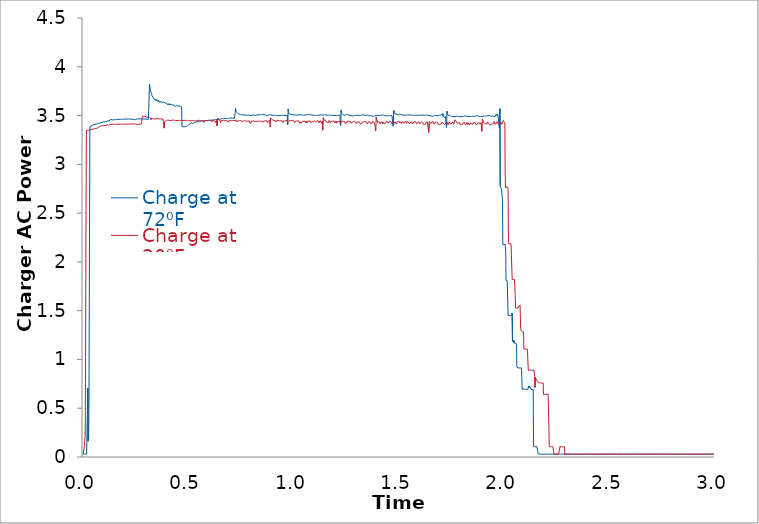
| Category | Charge at 72⁰F | Charge at 20⁰F |
|---|---|---|
| 0.0 | 0.029 | 0.029 |
| 0.00138888888888889 | 0.029 | 0.029 |
| 0.00277777777777778 | 0.03 | 0.029 |
| 0.00416666666666667 | 0.03 | 0.03 |
| 0.00555555555555556 | 0.03 | 0.107 |
| 0.00694444444444444 | 0.03 | 0.159 |
| 0.00833333333333333 | 0.03 | 0.152 |
| 0.00972222222222222 | 0.03 | 0.212 |
| 0.0111111111111111 | 0.03 | 0.763 |
| 0.0125 | 0.03 | 1.694 |
| 0.0138888888888889 | 0.03 | 2.648 |
| 0.0152777777777778 | 0.03 | 3.348 |
| 0.0166666666666667 | 0.03 | 3.348 |
| 0.0180555555555556 | 0.03 | 3.344 |
| 0.0194444444444444 | 0.03 | 3.345 |
| 0.0208333333333333 | 0.03 | 3.349 |
| 0.0222222222222222 | 0.708 | 3.345 |
| 0.0236111111111111 | 0.163 | 3.349 |
| 0.025 | 0.155 | 3.35 |
| 0.0263888888888889 | 0.211 | 3.35 |
| 0.0277777777777778 | 0.617 | 3.352 |
| 0.0291666666666667 | 1.54 | 3.352 |
| 0.0305555555555556 | 2.491 | 3.351 |
| 0.0319444444444444 | 3.382 | 3.352 |
| 0.0333333333333333 | 3.384 | 3.353 |
| 0.0347222222222222 | 3.384 | 3.355 |
| 0.0361111111111111 | 3.386 | 3.358 |
| 0.0375 | 3.385 | 3.36 |
| 0.0388888888888889 | 3.393 | 3.358 |
| 0.0402777777777778 | 3.4 | 3.357 |
| 0.0416666666666667 | 3.403 | 3.358 |
| 0.0430555555555556 | 3.401 | 3.36 |
| 0.0444444444444444 | 3.399 | 3.36 |
| 0.0458333333333333 | 3.402 | 3.361 |
| 0.0472222222222222 | 3.404 | 3.363 |
| 0.0486111111111111 | 3.404 | 3.363 |
| 0.05 | 3.407 | 3.365 |
| 0.0513888888888889 | 3.407 | 3.366 |
| 0.0527777777777778 | 3.411 | 3.364 |
| 0.0541666666666667 | 3.407 | 3.366 |
| 0.0555555555555556 | 3.412 | 3.368 |
| 0.0569444444444444 | 3.411 | 3.367 |
| 0.0583333333333333 | 3.411 | 3.369 |
| 0.0597222222222222 | 3.409 | 3.368 |
| 0.0611111111111111 | 3.411 | 3.373 |
| 0.0625 | 3.413 | 3.367 |
| 0.0638888888888889 | 3.417 | 3.368 |
| 0.0652777777777778 | 3.417 | 3.37 |
| 0.0666666666666667 | 3.413 | 3.371 |
| 0.0680555555555556 | 3.416 | 3.372 |
| 0.0694444444444445 | 3.418 | 3.374 |
| 0.0708333333333333 | 3.421 | 3.376 |
| 0.0722222222222222 | 3.418 | 3.377 |
| 0.0736111111111111 | 3.419 | 3.376 |
| 0.075 | 3.422 | 3.387 |
| 0.0763888888888889 | 3.423 | 3.387 |
| 0.0777777777777778 | 3.424 | 3.387 |
| 0.0791666666666667 | 3.424 | 3.387 |
| 0.0805555555555556 | 3.427 | 3.391 |
| 0.0819444444444444 | 3.426 | 3.391 |
| 0.0833333333333333 | 3.425 | 3.388 |
| 0.0847222222222222 | 3.425 | 3.39 |
| 0.0861111111111111 | 3.427 | 3.392 |
| 0.0875 | 3.429 | 3.394 |
| 0.0888888888888889 | 3.429 | 3.395 |
| 0.0902777777777778 | 3.431 | 3.396 |
| 0.0916666666666667 | 3.431 | 3.394 |
| 0.0930555555555556 | 3.433 | 3.397 |
| 0.0944444444444444 | 3.436 | 3.395 |
| 0.0958333333333333 | 3.433 | 3.399 |
| 0.0972222222222222 | 3.43 | 3.398 |
| 0.0986111111111111 | 3.431 | 3.395 |
| 0.1 | 3.432 | 3.398 |
| 0.101388888888889 | 3.435 | 3.4 |
| 0.102777777777778 | 3.438 | 3.394 |
| 0.104166666666667 | 3.438 | 3.396 |
| 0.105555555555556 | 3.439 | 3.398 |
| 0.106944444444444 | 3.44 | 3.398 |
| 0.108333333333333 | 3.441 | 3.4 |
| 0.109722222222222 | 3.441 | 3.399 |
| 0.111111111111111 | 3.439 | 3.401 |
| 0.1125 | 3.441 | 3.403 |
| 0.113888888888889 | 3.444 | 3.404 |
| 0.115277777777778 | 3.444 | 3.404 |
| 0.116666666666667 | 3.442 | 3.401 |
| 0.118055555555556 | 3.446 | 3.41 |
| 0.119444444444444 | 3.441 | 3.407 |
| 0.120833333333333 | 3.445 | 3.402 |
| 0.122222222222222 | 3.446 | 3.403 |
| 0.123611111111111 | 3.442 | 3.406 |
| 0.125 | 3.444 | 3.405 |
| 0.126388888888889 | 3.455 | 3.406 |
| 0.127777777777778 | 3.457 | 3.406 |
| 0.129166666666667 | 3.456 | 3.405 |
| 0.130555555555556 | 3.457 | 3.407 |
| 0.131944444444444 | 3.461 | 3.408 |
| 0.133333333333333 | 3.456 | 3.41 |
| 0.134722222222222 | 3.46 | 3.411 |
| 0.136111111111111 | 3.46 | 3.41 |
| 0.1375 | 3.454 | 3.412 |
| 0.138888888888889 | 3.457 | 3.41 |
| 0.140277777777778 | 3.458 | 3.408 |
| 0.141666666666667 | 3.456 | 3.41 |
| 0.143055555555556 | 3.456 | 3.409 |
| 0.144444444444444 | 3.457 | 3.413 |
| 0.145833333333333 | 3.458 | 3.416 |
| 0.147222222222222 | 3.456 | 3.41 |
| 0.148611111111111 | 3.459 | 3.41 |
| 0.15 | 3.459 | 3.414 |
| 0.151388888888889 | 3.457 | 3.41 |
| 0.152777777777778 | 3.458 | 3.414 |
| 0.154166666666667 | 3.457 | 3.409 |
| 0.155555555555556 | 3.46 | 3.408 |
| 0.156944444444444 | 3.461 | 3.408 |
| 0.158333333333333 | 3.463 | 3.41 |
| 0.159722222222222 | 3.462 | 3.41 |
| 0.161111111111111 | 3.458 | 3.407 |
| 0.1625 | 3.46 | 3.409 |
| 0.163888888888889 | 3.459 | 3.408 |
| 0.165277777777778 | 3.461 | 3.41 |
| 0.166666666666667 | 3.461 | 3.41 |
| 0.168055555555556 | 3.463 | 3.411 |
| 0.169444444444444 | 3.462 | 3.408 |
| 0.170833333333333 | 3.461 | 3.411 |
| 0.172222222222222 | 3.459 | 3.409 |
| 0.173611111111111 | 3.457 | 3.407 |
| 0.175 | 3.459 | 3.409 |
| 0.176388888888889 | 3.462 | 3.412 |
| 0.177777777777778 | 3.46 | 3.41 |
| 0.179166666666667 | 3.458 | 3.411 |
| 0.180555555555556 | 3.458 | 3.411 |
| 0.181944444444444 | 3.462 | 3.41 |
| 0.183333333333333 | 3.461 | 3.412 |
| 0.184722222222222 | 3.46 | 3.412 |
| 0.186111111111111 | 3.463 | 3.412 |
| 0.1875 | 3.462 | 3.411 |
| 0.188888888888889 | 3.461 | 3.413 |
| 0.190277777777778 | 3.464 | 3.415 |
| 0.191666666666667 | 3.462 | 3.416 |
| 0.193055555555556 | 3.462 | 3.413 |
| 0.194444444444444 | 3.465 | 3.411 |
| 0.195833333333333 | 3.465 | 3.408 |
| 0.197222222222222 | 3.464 | 3.412 |
| 0.198611111111111 | 3.466 | 3.411 |
| 0.2 | 3.466 | 3.409 |
| 0.201388888888889 | 3.467 | 3.411 |
| 0.202777777777778 | 3.464 | 3.413 |
| 0.204166666666667 | 3.464 | 3.413 |
| 0.205555555555556 | 3.464 | 3.413 |
| 0.206944444444444 | 3.464 | 3.411 |
| 0.208333333333333 | 3.46 | 3.414 |
| 0.209722222222222 | 3.462 | 3.411 |
| 0.211111111111111 | 3.463 | 3.414 |
| 0.2125 | 3.462 | 3.412 |
| 0.213888888888889 | 3.464 | 3.412 |
| 0.215277777777778 | 3.465 | 3.412 |
| 0.216666666666667 | 3.466 | 3.413 |
| 0.218055555555556 | 3.466 | 3.411 |
| 0.219444444444444 | 3.465 | 3.414 |
| 0.220833333333333 | 3.465 | 3.412 |
| 0.222222222222222 | 3.461 | 3.414 |
| 0.223611111111111 | 3.462 | 3.415 |
| 0.225 | 3.462 | 3.412 |
| 0.226388888888889 | 3.463 | 3.413 |
| 0.227777777777778 | 3.461 | 3.415 |
| 0.229166666666667 | 3.464 | 3.416 |
| 0.230555555555556 | 3.461 | 3.417 |
| 0.231944444444444 | 3.462 | 3.415 |
| 0.233333333333333 | 3.463 | 3.416 |
| 0.234722222222222 | 3.462 | 3.417 |
| 0.236111111111111 | 3.46 | 3.414 |
| 0.2375 | 3.462 | 3.415 |
| 0.238888888888889 | 3.46 | 3.414 |
| 0.240277777777778 | 3.457 | 3.411 |
| 0.241666666666667 | 3.46 | 3.413 |
| 0.243055555555556 | 3.459 | 3.413 |
| 0.244444444444444 | 3.458 | 3.415 |
| 0.245833333333333 | 3.464 | 3.412 |
| 0.247222222222222 | 3.461 | 3.413 |
| 0.248611111111111 | 3.458 | 3.413 |
| 0.25 | 3.459 | 3.413 |
| 0.251388888888889 | 3.462 | 3.414 |
| 0.252777777777778 | 3.464 | 3.416 |
| 0.254166666666667 | 3.464 | 3.409 |
| 0.255555555555556 | 3.463 | 3.412 |
| 0.256944444444444 | 3.464 | 3.41 |
| 0.258333333333333 | 3.465 | 3.412 |
| 0.259722222222222 | 3.465 | 3.408 |
| 0.261111111111111 | 3.466 | 3.412 |
| 0.2625 | 3.463 | 3.413 |
| 0.263888888888889 | 3.466 | 3.411 |
| 0.265277777777778 | 3.467 | 3.411 |
| 0.266666666666667 | 3.466 | 3.413 |
| 0.268055555555556 | 3.469 | 3.411 |
| 0.269444444444444 | 3.469 | 3.41 |
| 0.270833333333333 | 3.467 | 3.411 |
| 0.272222222222222 | 3.468 | 3.411 |
| 0.273611111111111 | 3.463 | 3.41 |
| 0.275 | 3.464 | 3.413 |
| 0.276388888888889 | 3.463 | 3.413 |
| 0.277777777777778 | 3.463 | 3.414 |
| 0.279166666666667 | 3.465 | 3.411 |
| 0.280555555555556 | 3.465 | 3.48 |
| 0.281944444444444 | 3.464 | 3.494 |
| 0.283333333333333 | 3.465 | 3.497 |
| 0.284722222222222 | 3.467 | 3.491 |
| 0.286111111111111 | 3.463 | 3.488 |
| 0.2875 | 3.465 | 3.486 |
| 0.288888888888889 | 3.464 | 3.49 |
| 0.290277777777778 | 3.463 | 3.491 |
| 0.291666666666667 | 3.463 | 3.49 |
| 0.293055555555556 | 3.463 | 3.497 |
| 0.294444444444444 | 3.464 | 3.487 |
| 0.295833333333333 | 3.463 | 3.491 |
| 0.297222222222222 | 3.465 | 3.488 |
| 0.298611111111111 | 3.465 | 3.485 |
| 0.3 | 3.464 | 3.486 |
| 0.301388888888889 | 3.464 | 3.485 |
| 0.302777777777778 | 3.463 | 3.484 |
| 0.304166666666667 | 3.462 | 3.483 |
| 0.305555555555556 | 3.461 | 3.481 |
| 0.306944444444444 | 3.457 | 3.476 |
| 0.308333333333333 | 3.461 | 3.482 |
| 0.309722222222222 | 3.46 | 3.482 |
| 0.311111111111111 | 3.462 | 3.479 |
| 0.3125 | 3.463 | 3.478 |
| 0.313888888888889 | 3.461 | 3.479 |
| 0.315277777777778 | 3.82 | 3.482 |
| 0.316666666666667 | 3.805 | 3.477 |
| 0.318055555555556 | 3.778 | 3.475 |
| 0.319444444444444 | 3.759 | 3.476 |
| 0.320833333333333 | 3.75 | 3.474 |
| 0.322222222222222 | 3.74 | 3.458 |
| 0.323611111111111 | 3.733 | 3.472 |
| 0.325 | 3.726 | 3.472 |
| 0.326388888888889 | 3.706 | 3.471 |
| 0.327777777777778 | 3.705 | 3.472 |
| 0.329166666666667 | 3.703 | 3.469 |
| 0.330555555555556 | 3.692 | 3.469 |
| 0.331944444444444 | 3.69 | 3.466 |
| 0.333333333333333 | 3.688 | 3.463 |
| 0.334722222222222 | 3.674 | 3.466 |
| 0.336111111111111 | 3.679 | 3.468 |
| 0.3375 | 3.679 | 3.463 |
| 0.338888888888889 | 3.677 | 3.464 |
| 0.340277777777778 | 3.668 | 3.462 |
| 0.341666666666667 | 3.669 | 3.472 |
| 0.343055555555556 | 3.669 | 3.464 |
| 0.344444444444444 | 3.655 | 3.461 |
| 0.345833333333333 | 3.667 | 3.465 |
| 0.347222222222222 | 3.666 | 3.467 |
| 0.348611111111111 | 3.651 | 3.466 |
| 0.35 | 3.661 | 3.477 |
| 0.351388888888889 | 3.663 | 3.466 |
| 0.352777777777778 | 3.657 | 3.468 |
| 0.354166666666667 | 3.657 | 3.468 |
| 0.355555555555556 | 3.643 | 3.466 |
| 0.356944444444444 | 3.652 | 3.467 |
| 0.358333333333333 | 3.655 | 3.468 |
| 0.359722222222222 | 3.653 | 3.464 |
| 0.361111111111111 | 3.641 | 3.465 |
| 0.3625 | 3.651 | 3.465 |
| 0.363888888888889 | 3.649 | 3.465 |
| 0.365277777777778 | 3.65 | 3.458 |
| 0.366666666666667 | 3.638 | 3.465 |
| 0.368055555555556 | 3.648 | 3.466 |
| 0.369444444444444 | 3.645 | 3.464 |
| 0.370833333333333 | 3.645 | 3.468 |
| 0.372222222222222 | 3.637 | 3.466 |
| 0.373611111111111 | 3.645 | 3.465 |
| 0.375 | 3.643 | 3.466 |
| 0.376388888888889 | 3.631 | 3.466 |
| 0.377777777777778 | 3.634 | 3.467 |
| 0.379166666666667 | 3.628 | 3.464 |
| 0.380555555555556 | 3.632 | 3.468 |
| 0.381944444444444 | 3.638 | 3.468 |
| 0.383333333333333 | 3.639 | 3.467 |
| 0.384722222222222 | 3.63 | 3.371 |
| 0.386111111111111 | 3.632 | 3.427 |
| 0.3875 | 3.631 | 3.431 |
| 0.388888888888889 | 3.629 | 3.436 |
| 0.390277777777778 | 3.629 | 3.443 |
| 0.391666666666667 | 3.627 | 3.443 |
| 0.393055555555556 | 3.622 | 3.445 |
| 0.394444444444444 | 3.626 | 3.447 |
| 0.395833333333333 | 3.624 | 3.447 |
| 0.397222222222222 | 3.627 | 3.449 |
| 0.398611111111111 | 3.613 | 3.449 |
| 0.4 | 3.616 | 3.453 |
| 0.401388888888889 | 3.615 | 3.453 |
| 0.402777777777778 | 3.621 | 3.45 |
| 0.404166666666667 | 3.62 | 3.45 |
| 0.405555555555556 | 3.618 | 3.452 |
| 0.406944444444444 | 3.616 | 3.452 |
| 0.408333333333333 | 3.608 | 3.451 |
| 0.409722222222222 | 3.623 | 3.449 |
| 0.411111111111111 | 3.617 | 3.452 |
| 0.4125 | 3.61 | 3.448 |
| 0.413888888888889 | 3.615 | 3.453 |
| 0.415277777777778 | 3.615 | 3.452 |
| 0.416666666666667 | 3.608 | 3.456 |
| 0.418055555555556 | 3.615 | 3.452 |
| 0.419444444444444 | 3.607 | 3.455 |
| 0.420833333333333 | 3.611 | 3.451 |
| 0.422222222222222 | 3.615 | 3.455 |
| 0.423611111111111 | 3.607 | 3.453 |
| 0.425 | 3.611 | 3.45 |
| 0.426388888888889 | 3.604 | 3.452 |
| 0.427777777777778 | 3.602 | 3.456 |
| 0.429166666666667 | 3.61 | 3.452 |
| 0.430555555555556 | 3.604 | 3.454 |
| 0.431944444444444 | 3.612 | 3.454 |
| 0.433333333333333 | 3.598 | 3.455 |
| 0.434722222222222 | 3.597 | 3.452 |
| 0.436111111111111 | 3.604 | 3.45 |
| 0.4375 | 3.602 | 3.455 |
| 0.438888888888889 | 3.594 | 3.456 |
| 0.440277777777778 | 3.603 | 3.45 |
| 0.441666666666667 | 3.603 | 3.45 |
| 0.443055555555556 | 3.598 | 3.449 |
| 0.444444444444444 | 3.604 | 3.449 |
| 0.445833333333333 | 3.6 | 3.45 |
| 0.447222222222222 | 3.604 | 3.45 |
| 0.448611111111111 | 3.602 | 3.448 |
| 0.45 | 3.596 | 3.448 |
| 0.451388888888889 | 3.6 | 3.45 |
| 0.452777777777778 | 3.589 | 3.45 |
| 0.454166666666667 | 3.605 | 3.449 |
| 0.455555555555556 | 3.6 | 3.449 |
| 0.456944444444444 | 3.595 | 3.452 |
| 0.458333333333333 | 3.597 | 3.448 |
| 0.459722222222222 | 3.599 | 3.448 |
| 0.461111111111111 | 3.594 | 3.449 |
| 0.4625 | 3.595 | 3.448 |
| 0.463888888888889 | 3.59 | 3.446 |
| 0.465277777777778 | 3.594 | 3.45 |
| 0.466666666666667 | 3.591 | 3.452 |
| 0.468055555555556 | 3.553 | 3.449 |
| 0.469444444444444 | 3.386 | 3.447 |
| 0.470833333333333 | 3.385 | 3.446 |
| 0.472222222222222 | 3.384 | 3.448 |
| 0.473611111111111 | 3.386 | 3.449 |
| 0.475 | 3.385 | 3.446 |
| 0.476388888888889 | 3.385 | 3.448 |
| 0.477777777777778 | 3.386 | 3.45 |
| 0.479166666666667 | 3.385 | 3.45 |
| 0.480555555555556 | 3.385 | 3.45 |
| 0.481944444444444 | 3.385 | 3.45 |
| 0.483333333333333 | 3.386 | 3.453 |
| 0.484722222222222 | 3.385 | 3.45 |
| 0.486111111111111 | 3.386 | 3.449 |
| 0.4875 | 3.386 | 3.449 |
| 0.488888888888889 | 3.383 | 3.452 |
| 0.490277777777778 | 3.386 | 3.451 |
| 0.491666666666667 | 3.385 | 3.448 |
| 0.493055555555556 | 3.386 | 3.45 |
| 0.494444444444444 | 3.391 | 3.45 |
| 0.495833333333333 | 3.394 | 3.447 |
| 0.497222222222222 | 3.397 | 3.447 |
| 0.498611111111111 | 3.4 | 3.446 |
| 0.5 | 3.402 | 3.446 |
| 0.501388888888889 | 3.404 | 3.447 |
| 0.502777777777778 | 3.407 | 3.449 |
| 0.504166666666667 | 3.409 | 3.448 |
| 0.505555555555556 | 3.411 | 3.445 |
| 0.506944444444444 | 3.414 | 3.446 |
| 0.508333333333333 | 3.415 | 3.447 |
| 0.509722222222222 | 3.417 | 3.449 |
| 0.511111111111111 | 3.42 | 3.447 |
| 0.5125 | 3.426 | 3.448 |
| 0.513888888888889 | 3.421 | 3.449 |
| 0.515277777777778 | 3.418 | 3.446 |
| 0.516666666666667 | 3.417 | 3.448 |
| 0.518055555555556 | 3.419 | 3.448 |
| 0.519444444444445 | 3.419 | 3.446 |
| 0.520833333333333 | 3.419 | 3.447 |
| 0.522222222222222 | 3.423 | 3.449 |
| 0.523611111111111 | 3.425 | 3.448 |
| 0.525 | 3.426 | 3.448 |
| 0.526388888888889 | 3.426 | 3.45 |
| 0.527777777777778 | 3.427 | 3.45 |
| 0.529166666666667 | 3.428 | 3.447 |
| 0.530555555555556 | 3.429 | 3.446 |
| 0.531944444444444 | 3.43 | 3.448 |
| 0.533333333333333 | 3.432 | 3.446 |
| 0.534722222222222 | 3.433 | 3.445 |
| 0.536111111111111 | 3.437 | 3.447 |
| 0.5375 | 3.437 | 3.447 |
| 0.538888888888889 | 3.435 | 3.446 |
| 0.540277777777778 | 3.437 | 3.444 |
| 0.541666666666667 | 3.435 | 3.449 |
| 0.543055555555556 | 3.435 | 3.444 |
| 0.544444444444444 | 3.434 | 3.447 |
| 0.545833333333333 | 3.437 | 3.449 |
| 0.547222222222222 | 3.437 | 3.452 |
| 0.548611111111111 | 3.436 | 3.448 |
| 0.55 | 3.439 | 3.448 |
| 0.551388888888889 | 3.438 | 3.452 |
| 0.552777777777778 | 3.438 | 3.449 |
| 0.554166666666667 | 3.437 | 3.446 |
| 0.555555555555556 | 3.437 | 3.45 |
| 0.556944444444445 | 3.44 | 3.449 |
| 0.558333333333333 | 3.438 | 3.447 |
| 0.559722222222222 | 3.439 | 3.451 |
| 0.561111111111111 | 3.44 | 3.452 |
| 0.5625 | 3.441 | 3.449 |
| 0.563888888888889 | 3.442 | 3.455 |
| 0.565277777777778 | 3.442 | 3.449 |
| 0.566666666666667 | 3.444 | 3.451 |
| 0.568055555555556 | 3.446 | 3.45 |
| 0.569444444444444 | 3.443 | 3.448 |
| 0.570833333333333 | 3.444 | 3.449 |
| 0.572222222222222 | 3.445 | 3.448 |
| 0.573611111111111 | 3.444 | 3.43 |
| 0.575 | 3.445 | 3.432 |
| 0.576388888888889 | 3.446 | 3.43 |
| 0.577777777777778 | 3.445 | 3.449 |
| 0.579166666666667 | 3.447 | 3.451 |
| 0.580555555555556 | 3.447 | 3.454 |
| 0.581944444444445 | 3.447 | 3.452 |
| 0.583333333333333 | 3.448 | 3.449 |
| 0.584722222222222 | 3.449 | 3.446 |
| 0.586111111111111 | 3.45 | 3.451 |
| 0.5875 | 3.448 | 3.447 |
| 0.588888888888889 | 3.449 | 3.448 |
| 0.590277777777778 | 3.45 | 3.451 |
| 0.591666666666667 | 3.449 | 3.451 |
| 0.593055555555556 | 3.451 | 3.45 |
| 0.594444444444444 | 3.451 | 3.448 |
| 0.595833333333333 | 3.451 | 3.453 |
| 0.597222222222222 | 3.451 | 3.451 |
| 0.598611111111111 | 3.45 | 3.452 |
| 0.6 | 3.449 | 3.456 |
| 0.601388888888889 | 3.449 | 3.452 |
| 0.602777777777778 | 3.451 | 3.449 |
| 0.604166666666667 | 3.45 | 3.452 |
| 0.605555555555556 | 3.451 | 3.452 |
| 0.606944444444444 | 3.45 | 3.45 |
| 0.608333333333333 | 3.452 | 3.45 |
| 0.609722222222222 | 3.453 | 3.45 |
| 0.611111111111111 | 3.452 | 3.435 |
| 0.6125 | 3.455 | 3.43 |
| 0.613888888888889 | 3.455 | 3.447 |
| 0.615277777777778 | 3.454 | 3.45 |
| 0.616666666666667 | 3.456 | 3.448 |
| 0.618055555555556 | 3.456 | 3.448 |
| 0.619444444444445 | 3.457 | 3.449 |
| 0.620833333333333 | 3.46 | 3.447 |
| 0.622222222222222 | 3.457 | 3.448 |
| 0.623611111111111 | 3.458 | 3.446 |
| 0.625 | 3.458 | 3.446 |
| 0.626388888888889 | 3.462 | 3.444 |
| 0.627777777777778 | 3.458 | 3.447 |
| 0.629166666666667 | 3.458 | 3.446 |
| 0.630555555555556 | 3.457 | 3.426 |
| 0.631944444444444 | 3.457 | 3.438 |
| 0.633333333333333 | 3.458 | 3.446 |
| 0.634722222222222 | 3.46 | 3.452 |
| 0.636111111111111 | 3.457 | 3.394 |
| 0.6375 | 3.461 | 3.403 |
| 0.638888888888889 | 3.462 | 3.472 |
| 0.640277777777778 | 3.459 | 3.466 |
| 0.641666666666667 | 3.459 | 3.465 |
| 0.643055555555556 | 3.459 | 3.459 |
| 0.644444444444445 | 3.458 | 3.456 |
| 0.645833333333333 | 3.462 | 3.457 |
| 0.647222222222222 | 3.461 | 3.456 |
| 0.648611111111111 | 3.46 | 3.454 |
| 0.65 | 3.46 | 3.448 |
| 0.651388888888889 | 3.462 | 3.448 |
| 0.652777777777778 | 3.464 | 3.427 |
| 0.654166666666667 | 3.463 | 3.43 |
| 0.655555555555556 | 3.464 | 3.448 |
| 0.656944444444444 | 3.467 | 3.446 |
| 0.658333333333333 | 3.464 | 3.446 |
| 0.659722222222222 | 3.466 | 3.449 |
| 0.661111111111111 | 3.466 | 3.449 |
| 0.6625 | 3.468 | 3.445 |
| 0.663888888888889 | 3.464 | 3.446 |
| 0.665277777777778 | 3.464 | 3.45 |
| 0.666666666666667 | 3.466 | 3.447 |
| 0.668055555555556 | 3.466 | 3.446 |
| 0.669444444444444 | 3.467 | 3.45 |
| 0.670833333333333 | 3.468 | 3.448 |
| 0.672222222222222 | 3.468 | 3.447 |
| 0.673611111111111 | 3.471 | 3.446 |
| 0.675 | 3.467 | 3.444 |
| 0.676388888888889 | 3.468 | 3.445 |
| 0.677777777777778 | 3.466 | 3.448 |
| 0.679166666666667 | 3.467 | 3.449 |
| 0.680555555555556 | 3.467 | 3.449 |
| 0.681944444444445 | 3.47 | 3.448 |
| 0.683333333333333 | 3.468 | 3.447 |
| 0.684722222222222 | 3.47 | 3.442 |
| 0.686111111111111 | 3.472 | 3.444 |
| 0.6875 | 3.47 | 3.447 |
| 0.688888888888889 | 3.471 | 3.433 |
| 0.690277777777778 | 3.47 | 3.432 |
| 0.691666666666667 | 3.469 | 3.431 |
| 0.693055555555556 | 3.47 | 3.453 |
| 0.694444444444444 | 3.472 | 3.45 |
| 0.695833333333333 | 3.475 | 3.45 |
| 0.697222222222222 | 3.474 | 3.447 |
| 0.698611111111111 | 3.471 | 3.447 |
| 0.7 | 3.474 | 3.449 |
| 0.701388888888889 | 3.473 | 3.452 |
| 0.702777777777778 | 3.473 | 3.452 |
| 0.704166666666667 | 3.474 | 3.448 |
| 0.705555555555556 | 3.474 | 3.453 |
| 0.706944444444445 | 3.473 | 3.45 |
| 0.708333333333333 | 3.473 | 3.452 |
| 0.709722222222222 | 3.469 | 3.449 |
| 0.711111111111111 | 3.469 | 3.45 |
| 0.7125 | 3.473 | 3.451 |
| 0.713888888888889 | 3.474 | 3.45 |
| 0.715277777777778 | 3.47 | 3.45 |
| 0.716666666666667 | 3.47 | 3.45 |
| 0.718055555555556 | 3.471 | 3.451 |
| 0.719444444444444 | 3.486 | 3.451 |
| 0.720833333333333 | 3.485 | 3.45 |
| 0.722222222222222 | 3.532 | 3.451 |
| 0.723611111111111 | 3.572 | 3.452 |
| 0.725 | 3.557 | 3.45 |
| 0.726388888888889 | 3.544 | 3.451 |
| 0.727777777777778 | 3.544 | 3.435 |
| 0.729166666666667 | 3.535 | 3.434 |
| 0.730555555555556 | 3.532 | 3.446 |
| 0.731944444444444 | 3.528 | 3.446 |
| 0.733333333333333 | 3.523 | 3.45 |
| 0.734722222222222 | 3.523 | 3.445 |
| 0.736111111111111 | 3.519 | 3.444 |
| 0.7375 | 3.521 | 3.443 |
| 0.738888888888889 | 3.518 | 3.443 |
| 0.740277777777778 | 3.515 | 3.447 |
| 0.741666666666667 | 3.514 | 3.447 |
| 0.743055555555556 | 3.512 | 3.444 |
| 0.744444444444445 | 3.512 | 3.444 |
| 0.745833333333333 | 3.507 | 3.447 |
| 0.747222222222222 | 3.509 | 3.45 |
| 0.748611111111111 | 3.509 | 3.444 |
| 0.75 | 3.512 | 3.444 |
| 0.751388888888889 | 3.509 | 3.447 |
| 0.752777777777778 | 3.509 | 3.446 |
| 0.754166666666667 | 3.51 | 3.447 |
| 0.755555555555556 | 3.51 | 3.434 |
| 0.756944444444444 | 3.504 | 3.427 |
| 0.758333333333333 | 3.507 | 3.429 |
| 0.759722222222222 | 3.509 | 3.435 |
| 0.761111111111111 | 3.508 | 3.445 |
| 0.7625 | 3.506 | 3.447 |
| 0.763888888888889 | 3.508 | 3.446 |
| 0.765277777777778 | 3.507 | 3.446 |
| 0.766666666666667 | 3.503 | 3.449 |
| 0.768055555555556 | 3.507 | 3.446 |
| 0.769444444444445 | 3.506 | 3.446 |
| 0.770833333333333 | 3.507 | 3.444 |
| 0.772222222222222 | 3.505 | 3.445 |
| 0.773611111111111 | 3.503 | 3.442 |
| 0.775 | 3.506 | 3.446 |
| 0.776388888888889 | 3.507 | 3.443 |
| 0.777777777777778 | 3.505 | 3.442 |
| 0.779166666666667 | 3.507 | 3.445 |
| 0.780555555555556 | 3.504 | 3.444 |
| 0.781944444444444 | 3.501 | 3.441 |
| 0.783333333333333 | 3.502 | 3.442 |
| 0.784722222222222 | 3.504 | 3.445 |
| 0.786111111111111 | 3.505 | 3.442 |
| 0.7875 | 3.504 | 3.444 |
| 0.788888888888889 | 3.501 | 3.445 |
| 0.790277777777778 | 3.503 | 3.447 |
| 0.791666666666667 | 3.5 | 3.425 |
| 0.793055555555556 | 3.502 | 3.426 |
| 0.794444444444444 | 3.505 | 3.425 |
| 0.795833333333333 | 3.505 | 3.426 |
| 0.797222222222222 | 3.502 | 3.422 |
| 0.798611111111111 | 3.505 | 3.442 |
| 0.8 | 3.503 | 3.442 |
| 0.801388888888889 | 3.502 | 3.442 |
| 0.802777777777778 | 3.502 | 3.441 |
| 0.804166666666667 | 3.5 | 3.442 |
| 0.805555555555556 | 3.504 | 3.44 |
| 0.806944444444445 | 3.501 | 3.441 |
| 0.808333333333333 | 3.505 | 3.442 |
| 0.809722222222222 | 3.503 | 3.446 |
| 0.811111111111111 | 3.502 | 3.441 |
| 0.8125 | 3.504 | 3.44 |
| 0.813888888888889 | 3.503 | 3.44 |
| 0.815277777777778 | 3.506 | 3.44 |
| 0.816666666666667 | 3.501 | 3.44 |
| 0.818055555555556 | 3.502 | 3.44 |
| 0.819444444444444 | 3.503 | 3.444 |
| 0.820833333333333 | 3.501 | 3.439 |
| 0.822222222222222 | 3.504 | 3.442 |
| 0.823611111111111 | 3.506 | 3.447 |
| 0.825 | 3.506 | 3.445 |
| 0.826388888888889 | 3.506 | 3.441 |
| 0.827777777777778 | 3.505 | 3.442 |
| 0.829166666666667 | 3.503 | 3.442 |
| 0.830555555555556 | 3.508 | 3.442 |
| 0.831944444444445 | 3.508 | 3.442 |
| 0.833333333333333 | 3.505 | 3.444 |
| 0.834722222222222 | 3.505 | 3.443 |
| 0.836111111111111 | 3.508 | 3.442 |
| 0.8375 | 3.505 | 3.442 |
| 0.838888888888889 | 3.508 | 3.443 |
| 0.840277777777778 | 3.508 | 3.445 |
| 0.841666666666667 | 3.51 | 3.446 |
| 0.843055555555556 | 3.511 | 3.443 |
| 0.844444444444444 | 3.51 | 3.442 |
| 0.845833333333333 | 3.51 | 3.444 |
| 0.847222222222222 | 3.509 | 3.445 |
| 0.848611111111111 | 3.508 | 3.443 |
| 0.85 | 3.51 | 3.446 |
| 0.851388888888889 | 3.51 | 3.449 |
| 0.852777777777778 | 3.507 | 3.43 |
| 0.854166666666667 | 3.509 | 3.429 |
| 0.855555555555556 | 3.513 | 3.439 |
| 0.856944444444444 | 3.512 | 3.442 |
| 0.858333333333333 | 3.513 | 3.442 |
| 0.859722222222222 | 3.511 | 3.443 |
| 0.861111111111111 | 3.509 | 3.445 |
| 0.8625 | 3.506 | 3.445 |
| 0.863888888888889 | 3.505 | 3.442 |
| 0.865277777777778 | 3.505 | 3.444 |
| 0.866666666666667 | 3.51 | 3.449 |
| 0.868055555555556 | 3.508 | 3.448 |
| 0.869444444444445 | 3.504 | 3.446 |
| 0.870833333333333 | 3.508 | 3.448 |
| 0.872222222222222 | 3.504 | 3.447 |
| 0.873611111111111 | 3.501 | 3.444 |
| 0.875 | 3.503 | 3.427 |
| 0.876388888888889 | 3.505 | 3.43 |
| 0.877777777777778 | 3.503 | 3.427 |
| 0.879166666666667 | 3.504 | 3.43 |
| 0.880555555555556 | 3.505 | 3.441 |
| 0.881944444444444 | 3.505 | 3.449 |
| 0.883333333333333 | 3.506 | 3.447 |
| 0.884722222222222 | 3.504 | 3.446 |
| 0.886111111111111 | 3.508 | 3.455 |
| 0.8875 | 3.506 | 3.382 |
| 0.888888888888889 | 3.502 | 3.396 |
| 0.890277777777778 | 3.504 | 3.476 |
| 0.891666666666667 | 3.508 | 3.473 |
| 0.893055555555556 | 3.504 | 3.467 |
| 0.894444444444445 | 3.504 | 3.463 |
| 0.895833333333333 | 3.502 | 3.461 |
| 0.897222222222222 | 3.501 | 3.466 |
| 0.898611111111111 | 3.499 | 3.459 |
| 0.9 | 3.501 | 3.455 |
| 0.901388888888889 | 3.499 | 3.453 |
| 0.902777777777778 | 3.502 | 3.455 |
| 0.904166666666667 | 3.501 | 3.452 |
| 0.905555555555556 | 3.499 | 3.449 |
| 0.906944444444444 | 3.501 | 3.455 |
| 0.908333333333333 | 3.503 | 3.455 |
| 0.909722222222222 | 3.5 | 3.451 |
| 0.911111111111111 | 3.502 | 3.45 |
| 0.9125 | 3.501 | 3.453 |
| 0.913888888888889 | 3.502 | 3.452 |
| 0.915277777777778 | 3.502 | 3.433 |
| 0.916666666666667 | 3.501 | 3.434 |
| 0.918055555555556 | 3.499 | 3.438 |
| 0.919444444444444 | 3.501 | 3.438 |
| 0.920833333333333 | 3.498 | 3.454 |
| 0.922222222222222 | 3.498 | 3.453 |
| 0.923611111111111 | 3.5 | 3.455 |
| 0.925 | 3.5 | 3.451 |
| 0.926388888888889 | 3.5 | 3.448 |
| 0.927777777777778 | 3.5 | 3.446 |
| 0.929166666666667 | 3.499 | 3.447 |
| 0.930555555555556 | 3.499 | 3.446 |
| 0.931944444444445 | 3.499 | 3.446 |
| 0.933333333333333 | 3.499 | 3.448 |
| 0.934722222222222 | 3.497 | 3.449 |
| 0.936111111111111 | 3.5 | 3.446 |
| 0.9375 | 3.501 | 3.446 |
| 0.938888888888889 | 3.502 | 3.448 |
| 0.940277777777778 | 3.504 | 3.446 |
| 0.941666666666667 | 3.502 | 3.451 |
| 0.943055555555556 | 3.502 | 3.448 |
| 0.944444444444444 | 3.501 | 3.448 |
| 0.945833333333333 | 3.5 | 3.444 |
| 0.947222222222222 | 3.502 | 3.446 |
| 0.948611111111111 | 3.503 | 3.427 |
| 0.95 | 3.504 | 3.434 |
| 0.951388888888889 | 3.501 | 3.445 |
| 0.952777777777778 | 3.502 | 3.448 |
| 0.954166666666667 | 3.506 | 3.445 |
| 0.955555555555556 | 3.498 | 3.446 |
| 0.956944444444445 | 3.502 | 3.443 |
| 0.958333333333333 | 3.501 | 3.447 |
| 0.959722222222222 | 3.504 | 3.447 |
| 0.961111111111111 | 3.502 | 3.448 |
| 0.9625 | 3.504 | 3.447 |
| 0.963888888888889 | 3.501 | 3.447 |
| 0.965277777777778 | 3.5 | 3.448 |
| 0.966666666666667 | 3.502 | 3.448 |
| 0.968055555555556 | 3.503 | 3.449 |
| 0.969444444444444 | 3.505 | 3.447 |
| 0.970833333333333 | 3.405 | 3.446 |
| 0.972222222222222 | 3.431 | 3.43 |
| 0.973611111111111 | 3.567 | 3.429 |
| 0.975 | 3.541 | 3.432 |
| 0.976388888888889 | 3.526 | 3.441 |
| 0.977777777777778 | 3.522 | 3.45 |
| 0.979166666666667 | 3.517 | 3.448 |
| 0.980555555555556 | 3.515 | 3.447 |
| 0.981944444444444 | 3.517 | 3.448 |
| 0.983333333333333 | 3.515 | 3.448 |
| 0.984722222222222 | 3.51 | 3.448 |
| 0.986111111111111 | 3.512 | 3.45 |
| 0.9875 | 3.512 | 3.449 |
| 0.988888888888889 | 3.509 | 3.449 |
| 0.990277777777778 | 3.509 | 3.45 |
| 0.991666666666667 | 3.509 | 3.45 |
| 0.993055555555556 | 3.509 | 3.448 |
| 0.994444444444445 | 3.506 | 3.448 |
| 0.995833333333333 | 3.511 | 3.445 |
| 0.997222222222222 | 3.508 | 3.448 |
| 0.998611111111111 | 3.504 | 3.451 |
| 1.0 | 3.509 | 3.449 |
| 1.00138888888889 | 3.505 | 3.451 |
| 1.00277777777778 | 3.505 | 3.448 |
| 1.00416666666667 | 3.507 | 3.426 |
| 1.00555555555556 | 3.507 | 3.429 |
| 1.00694444444444 | 3.507 | 3.427 |
| 1.00833333333333 | 3.507 | 3.443 |
| 1.00972222222222 | 3.505 | 3.44 |
| 1.01111111111111 | 3.509 | 3.443 |
| 1.0125 | 3.504 | 3.443 |
| 1.01388888888889 | 3.506 | 3.444 |
| 1.01527777777778 | 3.509 | 3.445 |
| 1.01666666666667 | 3.511 | 3.442 |
| 1.01805555555556 | 3.508 | 3.444 |
| 1.01944444444444 | 3.507 | 3.445 |
| 1.02083333333333 | 3.506 | 3.443 |
| 1.02222222222222 | 3.504 | 3.444 |
| 1.02361111111111 | 3.51 | 3.444 |
| 1.025 | 3.508 | 3.445 |
| 1.02638888888889 | 3.508 | 3.44 |
| 1.02777777777778 | 3.509 | 3.44 |
| 1.02916666666667 | 3.511 | 3.421 |
| 1.03055555555556 | 3.508 | 3.436 |
| 1.03194444444444 | 3.513 | 3.439 |
| 1.03333333333333 | 3.507 | 3.439 |
| 1.03472222222222 | 3.511 | 3.441 |
| 1.03611111111111 | 3.507 | 3.422 |
| 1.0375 | 3.505 | 3.423 |
| 1.03888888888889 | 3.506 | 3.434 |
| 1.04027777777778 | 3.505 | 3.443 |
| 1.04166666666667 | 3.504 | 3.442 |
| 1.04305555555556 | 3.504 | 3.441 |
| 1.04444444444444 | 3.504 | 3.442 |
| 1.04583333333333 | 3.503 | 3.441 |
| 1.04722222222222 | 3.506 | 3.442 |
| 1.04861111111111 | 3.507 | 3.442 |
| 1.05 | 3.505 | 3.443 |
| 1.05138888888889 | 3.503 | 3.443 |
| 1.05277777777778 | 3.506 | 3.442 |
| 1.05416666666667 | 3.508 | 3.446 |
| 1.05555555555556 | 3.506 | 3.442 |
| 1.05694444444444 | 3.505 | 3.442 |
| 1.05833333333333 | 3.508 | 3.426 |
| 1.05972222222222 | 3.508 | 3.426 |
| 1.06111111111111 | 3.508 | 3.442 |
| 1.0625 | 3.505 | 3.44 |
| 1.06388888888889 | 3.507 | 3.425 |
| 1.06527777777778 | 3.508 | 3.435 |
| 1.06666666666667 | 3.508 | 3.443 |
| 1.06805555555556 | 3.508 | 3.442 |
| 1.06944444444444 | 3.511 | 3.448 |
| 1.07083333333333 | 3.51 | 3.446 |
| 1.07222222222222 | 3.509 | 3.443 |
| 1.07361111111111 | 3.51 | 3.442 |
| 1.075 | 3.511 | 3.442 |
| 1.07638888888889 | 3.511 | 3.444 |
| 1.07777777777778 | 3.508 | 3.446 |
| 1.07916666666667 | 3.511 | 3.444 |
| 1.08055555555556 | 3.508 | 3.441 |
| 1.08194444444444 | 3.505 | 3.426 |
| 1.08333333333333 | 3.504 | 3.424 |
| 1.08472222222222 | 3.504 | 3.422 |
| 1.08611111111111 | 3.505 | 3.426 |
| 1.0875 | 3.507 | 3.439 |
| 1.08888888888889 | 3.503 | 3.442 |
| 1.09027777777778 | 3.504 | 3.447 |
| 1.09166666666667 | 3.505 | 3.445 |
| 1.09305555555556 | 3.505 | 3.44 |
| 1.09444444444444 | 3.504 | 3.442 |
| 1.09583333333333 | 3.505 | 3.449 |
| 1.09722222222222 | 3.503 | 3.445 |
| 1.09861111111111 | 3.506 | 3.445 |
| 1.1 | 3.502 | 3.444 |
| 1.10138888888889 | 3.501 | 3.446 |
| 1.10277777777778 | 3.501 | 3.448 |
| 1.10416666666667 | 3.501 | 3.434 |
| 1.10555555555556 | 3.502 | 3.428 |
| 1.10694444444444 | 3.502 | 3.428 |
| 1.10833333333333 | 3.502 | 3.437 |
| 1.10972222222222 | 3.502 | 3.448 |
| 1.11111111111111 | 3.503 | 3.449 |
| 1.1125 | 3.504 | 3.446 |
| 1.11388888888889 | 3.504 | 3.446 |
| 1.11527777777778 | 3.506 | 3.445 |
| 1.11666666666667 | 3.504 | 3.445 |
| 1.11805555555556 | 3.505 | 3.442 |
| 1.11944444444444 | 3.503 | 3.446 |
| 1.12083333333333 | 3.505 | 3.427 |
| 1.12222222222222 | 3.507 | 3.426 |
| 1.12361111111111 | 3.507 | 3.444 |
| 1.125 | 3.505 | 3.44 |
| 1.12638888888889 | 3.504 | 3.445 |
| 1.12777777777778 | 3.508 | 3.445 |
| 1.12916666666667 | 3.506 | 3.445 |
| 1.13055555555556 | 3.508 | 3.444 |
| 1.13194444444444 | 3.509 | 3.42 |
| 1.13333333333333 | 3.506 | 3.427 |
| 1.13472222222222 | 3.506 | 3.426 |
| 1.13611111111111 | 3.504 | 3.443 |
| 1.1375 | 3.504 | 3.35 |
| 1.13888888888889 | 3.504 | 3.378 |
| 1.14027777777778 | 3.507 | 3.477 |
| 1.14166666666667 | 3.505 | 3.471 |
| 1.14305555555556 | 3.509 | 3.459 |
| 1.14444444444444 | 3.504 | 3.459 |
| 1.14583333333333 | 3.507 | 3.454 |
| 1.14722222222222 | 3.509 | 3.454 |
| 1.14861111111111 | 3.505 | 3.451 |
| 1.15 | 3.506 | 3.453 |
| 1.15138888888889 | 3.506 | 3.452 |
| 1.15277777777778 | 3.506 | 3.448 |
| 1.15416666666667 | 3.503 | 3.444 |
| 1.15555555555556 | 3.504 | 3.448 |
| 1.15694444444444 | 3.5 | 3.448 |
| 1.15833333333333 | 3.503 | 3.428 |
| 1.15972222222222 | 3.502 | 3.428 |
| 1.16111111111111 | 3.504 | 3.429 |
| 1.1625 | 3.505 | 3.425 |
| 1.16388888888889 | 3.506 | 3.428 |
| 1.16527777777778 | 3.503 | 3.446 |
| 1.16666666666667 | 3.505 | 3.442 |
| 1.16805555555556 | 3.501 | 3.449 |
| 1.16944444444444 | 3.503 | 3.445 |
| 1.17083333333333 | 3.502 | 3.446 |
| 1.17222222222222 | 3.501 | 3.437 |
| 1.17361111111111 | 3.503 | 3.423 |
| 1.175 | 3.501 | 3.427 |
| 1.17638888888889 | 3.501 | 3.437 |
| 1.17777777777778 | 3.5 | 3.441 |
| 1.17916666666667 | 3.497 | 3.442 |
| 1.18055555555556 | 3.502 | 3.443 |
| 1.18194444444444 | 3.502 | 3.443 |
| 1.18333333333333 | 3.504 | 3.444 |
| 1.18472222222222 | 3.5 | 3.442 |
| 1.18611111111111 | 3.501 | 3.444 |
| 1.1875 | 3.501 | 3.443 |
| 1.18888888888889 | 3.501 | 3.443 |
| 1.19027777777778 | 3.502 | 3.435 |
| 1.19166666666667 | 3.501 | 3.442 |
| 1.19305555555556 | 3.5 | 3.442 |
| 1.19444444444444 | 3.502 | 3.442 |
| 1.19583333333333 | 3.502 | 3.424 |
| 1.19722222222222 | 3.501 | 3.424 |
| 1.19861111111111 | 3.501 | 3.424 |
| 1.2 | 3.5 | 3.421 |
| 1.20138888888889 | 3.498 | 3.443 |
| 1.20277777777778 | 3.5 | 3.438 |
| 1.20416666666667 | 3.5 | 3.423 |
| 1.20555555555556 | 3.497 | 3.422 |
| 1.20694444444444 | 3.5 | 3.439 |
| 1.20833333333333 | 3.499 | 3.438 |
| 1.20972222222222 | 3.5 | 3.434 |
| 1.21111111111111 | 3.5 | 3.436 |
| 1.2125 | 3.504 | 3.439 |
| 1.21388888888889 | 3.503 | 3.438 |
| 1.21527777777778 | 3.505 | 3.436 |
| 1.21666666666667 | 3.504 | 3.436 |
| 1.21805555555556 | 3.503 | 3.442 |
| 1.21944444444444 | 3.505 | 3.44 |
| 1.22083333333333 | 3.502 | 3.419 |
| 1.22222222222222 | 3.398 | 3.419 |
| 1.22361111111111 | 3.42 | 3.423 |
| 1.225 | 3.558 | 3.43 |
| 1.22638888888889 | 3.532 | 3.441 |
| 1.22777777777778 | 3.519 | 3.44 |
| 1.22916666666667 | 3.518 | 3.445 |
| 1.23055555555556 | 3.514 | 3.444 |
| 1.23194444444444 | 3.512 | 3.443 |
| 1.23333333333333 | 3.512 | 3.441 |
| 1.23472222222222 | 3.512 | 3.439 |
| 1.23611111111111 | 3.507 | 3.435 |
| 1.2375 | 3.502 | 3.438 |
| 1.23888888888889 | 3.502 | 3.439 |
| 1.24027777777778 | 3.501 | 3.437 |
| 1.24166666666667 | 3.506 | 3.436 |
| 1.24305555555556 | 3.508 | 3.436 |
| 1.24444444444444 | 3.507 | 3.42 |
| 1.24583333333333 | 3.507 | 3.422 |
| 1.24722222222222 | 3.507 | 3.421 |
| 1.24861111111111 | 3.508 | 3.422 |
| 1.25 | 3.51 | 3.423 |
| 1.25138888888889 | 3.506 | 3.426 |
| 1.25277777777778 | 3.506 | 3.439 |
| 1.25416666666667 | 3.507 | 3.443 |
| 1.25555555555556 | 3.508 | 3.445 |
| 1.25694444444444 | 3.503 | 3.442 |
| 1.25833333333333 | 3.508 | 3.445 |
| 1.25972222222222 | 3.506 | 3.442 |
| 1.26111111111111 | 3.503 | 3.44 |
| 1.2625 | 3.503 | 3.441 |
| 1.26388888888889 | 3.504 | 3.439 |
| 1.26527777777778 | 3.503 | 3.44 |
| 1.26666666666667 | 3.502 | 3.434 |
| 1.26805555555556 | 3.504 | 3.438 |
| 1.26944444444444 | 3.505 | 3.439 |
| 1.27083333333333 | 3.504 | 3.44 |
| 1.27222222222222 | 3.5 | 3.42 |
| 1.27361111111111 | 3.505 | 3.421 |
| 1.275 | 3.499 | 3.42 |
| 1.27638888888889 | 3.499 | 3.419 |
| 1.27777777777778 | 3.496 | 3.433 |
| 1.27916666666667 | 3.496 | 3.438 |
| 1.28055555555556 | 3.496 | 3.44 |
| 1.28194444444444 | 3.5 | 3.441 |
| 1.28333333333333 | 3.499 | 3.439 |
| 1.28472222222222 | 3.499 | 3.439 |
| 1.28611111111111 | 3.499 | 3.442 |
| 1.2875 | 3.499 | 3.44 |
| 1.28888888888889 | 3.5 | 3.442 |
| 1.29027777777778 | 3.503 | 3.438 |
| 1.29166666666667 | 3.502 | 3.44 |
| 1.29305555555556 | 3.502 | 3.439 |
| 1.29444444444444 | 3.502 | 3.424 |
| 1.29583333333333 | 3.503 | 3.425 |
| 1.29722222222222 | 3.504 | 3.422 |
| 1.29861111111111 | 3.502 | 3.418 |
| 1.3 | 3.502 | 3.419 |
| 1.30138888888889 | 3.502 | 3.438 |
| 1.30277777777778 | 3.501 | 3.435 |
| 1.30416666666667 | 3.505 | 3.433 |
| 1.30555555555556 | 3.506 | 3.436 |
| 1.30694444444444 | 3.497 | 3.436 |
| 1.30833333333333 | 3.498 | 3.438 |
| 1.30972222222222 | 3.501 | 3.437 |
| 1.31111111111111 | 3.5 | 3.438 |
| 1.3125 | 3.503 | 3.432 |
| 1.31388888888889 | 3.501 | 3.441 |
| 1.31527777777778 | 3.5 | 3.438 |
| 1.31666666666667 | 3.501 | 3.414 |
| 1.31805555555556 | 3.502 | 3.418 |
| 1.31944444444444 | 3.502 | 3.418 |
| 1.32083333333333 | 3.503 | 3.416 |
| 1.32222222222222 | 3.505 | 3.417 |
| 1.32361111111111 | 3.502 | 3.417 |
| 1.325 | 3.503 | 3.42 |
| 1.32638888888889 | 3.505 | 3.433 |
| 1.32777777777778 | 3.508 | 3.437 |
| 1.32916666666667 | 3.501 | 3.435 |
| 1.33055555555556 | 3.504 | 3.437 |
| 1.33194444444444 | 3.505 | 3.436 |
| 1.33333333333333 | 3.504 | 3.437 |
| 1.33472222222222 | 3.506 | 3.436 |
| 1.33611111111111 | 3.504 | 3.44 |
| 1.3375 | 3.503 | 3.438 |
| 1.33888888888889 | 3.503 | 3.44 |
| 1.34027777777778 | 3.501 | 3.44 |
| 1.34166666666667 | 3.502 | 3.439 |
| 1.34305555555556 | 3.502 | 3.438 |
| 1.34444444444444 | 3.502 | 3.437 |
| 1.34583333333333 | 3.505 | 3.435 |
| 1.34722222222222 | 3.499 | 3.417 |
| 1.34861111111111 | 3.502 | 3.415 |
| 1.35 | 3.503 | 3.418 |
| 1.35138888888889 | 3.502 | 3.419 |
| 1.35277777777778 | 3.502 | 3.421 |
| 1.35416666666667 | 3.497 | 3.426 |
| 1.35555555555556 | 3.499 | 3.439 |
| 1.35694444444444 | 3.5 | 3.439 |
| 1.35833333333333 | 3.493 | 3.439 |
| 1.35972222222222 | 3.498 | 3.438 |
| 1.36111111111111 | 3.498 | 3.435 |
| 1.3625 | 3.499 | 3.441 |
| 1.36388888888889 | 3.5 | 3.44 |
| 1.36527777777778 | 3.5 | 3.441 |
| 1.36666666666667 | 3.5 | 3.416 |
| 1.36805555555556 | 3.497 | 3.422 |
| 1.36944444444444 | 3.495 | 3.419 |
| 1.37083333333333 | 3.495 | 3.418 |
| 1.37222222222222 | 3.495 | 3.419 |
| 1.37361111111111 | 3.492 | 3.44 |
| 1.375 | 3.494 | 3.439 |
| 1.37638888888889 | 3.495 | 3.437 |
| 1.37777777777778 | 3.492 | 3.434 |
| 1.37916666666667 | 3.494 | 3.436 |
| 1.38055555555556 | 3.496 | 3.438 |
| 1.38194444444444 | 3.495 | 3.435 |
| 1.38333333333333 | 3.498 | 3.438 |
| 1.38472222222222 | 3.494 | 3.417 |
| 1.38611111111111 | 3.498 | 3.415 |
| 1.3875 | 3.499 | 3.422 |
| 1.38888888888889 | 3.499 | 3.342 |
| 1.39027777777778 | 3.497 | 3.37 |
| 1.39166666666667 | 3.5 | 3.483 |
| 1.39305555555556 | 3.499 | 3.463 |
| 1.39444444444444 | 3.5 | 3.456 |
| 1.39583333333333 | 3.501 | 3.453 |
| 1.39722222222222 | 3.498 | 3.45 |
| 1.39861111111111 | 3.498 | 3.429 |
| 1.4 | 3.501 | 3.423 |
| 1.40138888888889 | 3.502 | 3.426 |
| 1.40277777777778 | 3.502 | 3.44 |
| 1.40416666666667 | 3.503 | 3.436 |
| 1.40555555555556 | 3.503 | 3.434 |
| 1.40694444444444 | 3.502 | 3.437 |
| 1.40833333333333 | 3.502 | 3.432 |
| 1.40972222222222 | 3.499 | 3.416 |
| 1.41111111111111 | 3.502 | 3.418 |
| 1.4125 | 3.504 | 3.411 |
| 1.41388888888889 | 3.504 | 3.433 |
| 1.41527777777778 | 3.504 | 3.433 |
| 1.41666666666667 | 3.505 | 3.434 |
| 1.41805555555556 | 3.504 | 3.431 |
| 1.41944444444444 | 3.505 | 3.433 |
| 1.42083333333333 | 3.504 | 3.432 |
| 1.42222222222222 | 3.505 | 3.415 |
| 1.42361111111111 | 3.504 | 3.418 |
| 1.425 | 3.502 | 3.435 |
| 1.42638888888889 | 3.502 | 3.434 |
| 1.42777777777778 | 3.503 | 3.436 |
| 1.42916666666667 | 3.502 | 3.429 |
| 1.43055555555556 | 3.497 | 3.415 |
| 1.43194444444444 | 3.501 | 3.418 |
| 1.43333333333333 | 3.499 | 3.416 |
| 1.43472222222222 | 3.498 | 3.42 |
| 1.43611111111111 | 3.501 | 3.419 |
| 1.4375 | 3.498 | 3.421 |
| 1.43888888888889 | 3.497 | 3.427 |
| 1.44027777777778 | 3.498 | 3.44 |
| 1.44166666666667 | 3.496 | 3.438 |
| 1.44305555555556 | 3.497 | 3.439 |
| 1.44444444444444 | 3.499 | 3.438 |
| 1.44583333333333 | 3.495 | 3.439 |
| 1.44722222222222 | 3.493 | 3.439 |
| 1.44861111111111 | 3.498 | 3.422 |
| 1.45 | 3.496 | 3.424 |
| 1.45138888888889 | 3.497 | 3.421 |
| 1.45277777777778 | 3.498 | 3.422 |
| 1.45416666666667 | 3.5 | 3.441 |
| 1.45555555555556 | 3.5 | 3.442 |
| 1.45694444444444 | 3.499 | 3.44 |
| 1.45833333333333 | 3.499 | 3.44 |
| 1.45972222222222 | 3.5 | 3.44 |
| 1.46111111111111 | 3.5 | 3.439 |
| 1.4625 | 3.5 | 3.441 |
| 1.46388888888889 | 3.5 | 3.419 |
| 1.46527777777778 | 3.501 | 3.416 |
| 1.46666666666667 | 3.5 | 3.415 |
| 1.46805555555556 | 3.502 | 3.433 |
| 1.46944444444444 | 3.501 | 3.434 |
| 1.47083333333333 | 3.498 | 3.434 |
| 1.47222222222222 | 3.391 | 3.44 |
| 1.47361111111111 | 3.386 | 3.437 |
| 1.475 | 3.551 | 3.431 |
| 1.47638888888889 | 3.557 | 3.433 |
| 1.47777777777778 | 3.533 | 3.42 |
| 1.47916666666667 | 3.527 | 3.416 |
| 1.48055555555556 | 3.52 | 3.415 |
| 1.48194444444444 | 3.517 | 3.437 |
| 1.48333333333333 | 3.515 | 3.431 |
| 1.48472222222222 | 3.515 | 3.415 |
| 1.48611111111111 | 3.515 | 3.42 |
| 1.4875 | 3.514 | 3.418 |
| 1.48888888888889 | 3.513 | 3.419 |
| 1.49027777777778 | 3.512 | 3.419 |
| 1.49166666666667 | 3.508 | 3.439 |
| 1.49305555555556 | 3.513 | 3.435 |
| 1.49444444444444 | 3.511 | 3.436 |
| 1.49583333333333 | 3.51 | 3.44 |
| 1.49722222222222 | 3.509 | 3.437 |
| 1.49861111111111 | 3.512 | 3.44 |
| 1.5 | 3.513 | 3.438 |
| 1.50138888888889 | 3.511 | 3.441 |
| 1.50277777777778 | 3.513 | 3.438 |
| 1.50416666666667 | 3.512 | 3.424 |
| 1.50555555555556 | 3.511 | 3.419 |
| 1.50694444444444 | 3.51 | 3.416 |
| 1.50833333333333 | 3.512 | 3.435 |
| 1.50972222222222 | 3.512 | 3.442 |
| 1.51111111111111 | 3.511 | 3.42 |
| 1.5125 | 3.506 | 3.418 |
| 1.51388888888889 | 3.506 | 3.419 |
| 1.51527777777778 | 3.509 | 3.418 |
| 1.51666666666667 | 3.506 | 3.437 |
| 1.51805555555556 | 3.507 | 3.435 |
| 1.51944444444444 | 3.506 | 3.436 |
| 1.52083333333333 | 3.507 | 3.436 |
| 1.52222222222222 | 3.505 | 3.419 |
| 1.52361111111111 | 3.503 | 3.416 |
| 1.525 | 3.503 | 3.416 |
| 1.52638888888889 | 3.502 | 3.418 |
| 1.52777777777778 | 3.503 | 3.438 |
| 1.52916666666667 | 3.504 | 3.437 |
| 1.53055555555556 | 3.504 | 3.438 |
| 1.53194444444444 | 3.504 | 3.439 |
| 1.53333333333333 | 3.504 | 3.438 |
| 1.53472222222222 | 3.506 | 3.439 |
| 1.53611111111111 | 3.505 | 3.42 |
| 1.5375 | 3.507 | 3.419 |
| 1.53888888888889 | 3.504 | 3.439 |
| 1.54027777777778 | 3.507 | 3.438 |
| 1.54166666666667 | 3.506 | 3.441 |
| 1.54305555555556 | 3.505 | 3.438 |
| 1.54444444444444 | 3.506 | 3.433 |
| 1.54583333333333 | 3.506 | 3.435 |
| 1.54722222222222 | 3.504 | 3.421 |
| 1.54861111111111 | 3.507 | 3.415 |
| 1.55 | 3.504 | 3.414 |
| 1.55138888888889 | 3.505 | 3.418 |
| 1.55277777777778 | 3.507 | 3.419 |
| 1.55416666666667 | 3.506 | 3.419 |
| 1.55555555555556 | 3.51 | 3.434 |
| 1.55694444444444 | 3.505 | 3.437 |
| 1.55833333333333 | 3.506 | 3.44 |
| 1.55972222222222 | 3.506 | 3.438 |
| 1.56111111111111 | 3.502 | 3.435 |
| 1.5625 | 3.497 | 3.431 |
| 1.56388888888889 | 3.499 | 3.414 |
| 1.56527777777778 | 3.501 | 3.412 |
| 1.56666666666667 | 3.501 | 3.414 |
| 1.56805555555556 | 3.502 | 3.413 |
| 1.56944444444444 | 3.504 | 3.433 |
| 1.57083333333333 | 3.506 | 3.434 |
| 1.57222222222222 | 3.5 | 3.434 |
| 1.57361111111111 | 3.504 | 3.434 |
| 1.575 | 3.502 | 3.436 |
| 1.57638888888889 | 3.501 | 3.433 |
| 1.57777777777778 | 3.498 | 3.436 |
| 1.57916666666667 | 3.503 | 3.434 |
| 1.58055555555556 | 3.503 | 3.434 |
| 1.58194444444444 | 3.501 | 3.416 |
| 1.58333333333333 | 3.499 | 3.415 |
| 1.58472222222222 | 3.504 | 3.417 |
| 1.58611111111111 | 3.501 | 3.416 |
| 1.5875 | 3.507 | 3.419 |
| 1.58888888888889 | 3.504 | 3.416 |
| 1.59027777777778 | 3.508 | 3.419 |
| 1.59166666666667 | 3.504 | 3.435 |
| 1.59305555555556 | 3.506 | 3.437 |
| 1.59444444444444 | 3.508 | 3.436 |
| 1.59583333333333 | 3.505 | 3.435 |
| 1.59722222222222 | 3.505 | 3.433 |
| 1.59861111111111 | 3.506 | 3.417 |
| 1.6 | 3.506 | 3.416 |
| 1.60138888888889 | 3.506 | 3.414 |
| 1.60277777777778 | 3.504 | 3.413 |
| 1.60416666666667 | 3.506 | 3.428 |
| 1.60555555555556 | 3.505 | 3.433 |
| 1.60694444444444 | 3.505 | 3.436 |
| 1.60833333333333 | 3.503 | 3.432 |
| 1.60972222222222 | 3.506 | 3.437 |
| 1.61111111111111 | 3.504 | 3.432 |
| 1.6125 | 3.503 | 3.429 |
| 1.61388888888889 | 3.504 | 3.426 |
| 1.61527777777778 | 3.507 | 3.41 |
| 1.61666666666667 | 3.504 | 3.41 |
| 1.61805555555556 | 3.505 | 3.416 |
| 1.61944444444444 | 3.504 | 3.41 |
| 1.62083333333333 | 3.506 | 3.409 |
| 1.62222222222222 | 3.505 | 3.413 |
| 1.62361111111111 | 3.505 | 3.409 |
| 1.625 | 3.503 | 3.411 |
| 1.62638888888889 | 3.503 | 3.411 |
| 1.62777777777778 | 3.503 | 3.415 |
| 1.62916666666667 | 3.504 | 3.432 |
| 1.63055555555556 | 3.505 | 3.437 |
| 1.63194444444444 | 3.507 | 3.437 |
| 1.63333333333333 | 3.507 | 3.432 |
| 1.63472222222222 | 3.505 | 3.435 |
| 1.63611111111111 | 3.504 | 3.429 |
| 1.6375 | 3.5 | 3.431 |
| 1.63888888888889 | 3.5 | 3.432 |
| 1.64027777777778 | 3.499 | 3.343 |
| 1.64166666666667 | 3.498 | 3.328 |
| 1.64305555555556 | 3.499 | 3.422 |
| 1.64444444444444 | 3.499 | 3.44 |
| 1.64583333333333 | 3.499 | 3.433 |
| 1.64722222222222 | 3.501 | 3.427 |
| 1.64861111111111 | 3.501 | 3.429 |
| 1.65 | 3.498 | 3.425 |
| 1.65138888888889 | 3.5 | 3.423 |
| 1.65277777777778 | 3.496 | 3.419 |
| 1.65416666666667 | 3.498 | 3.416 |
| 1.65555555555556 | 3.496 | 3.416 |
| 1.65694444444444 | 3.495 | 3.436 |
| 1.65833333333333 | 3.492 | 3.434 |
| 1.65972222222222 | 3.496 | 3.437 |
| 1.66111111111111 | 3.497 | 3.435 |
| 1.6625 | 3.493 | 3.437 |
| 1.66388888888889 | 3.497 | 3.436 |
| 1.66527777777778 | 3.495 | 3.417 |
| 1.66666666666667 | 3.497 | 3.417 |
| 1.66805555555556 | 3.5 | 3.415 |
| 1.66944444444444 | 3.502 | 3.42 |
| 1.67083333333333 | 3.501 | 3.417 |
| 1.67222222222222 | 3.505 | 3.433 |
| 1.67361111111111 | 3.502 | 3.428 |
| 1.675 | 3.499 | 3.431 |
| 1.67638888888889 | 3.501 | 3.429 |
| 1.67777777777778 | 3.5 | 3.432 |
| 1.67916666666667 | 3.5 | 3.43 |
| 1.68055555555556 | 3.498 | 3.429 |
| 1.68194444444444 | 3.497 | 3.432 |
| 1.68333333333333 | 3.499 | 3.429 |
| 1.68472222222222 | 3.493 | 3.431 |
| 1.68611111111111 | 3.498 | 3.41 |
| 1.6875 | 3.497 | 3.411 |
| 1.68888888888889 | 3.499 | 3.407 |
| 1.69027777777778 | 3.498 | 3.408 |
| 1.69166666666667 | 3.505 | 3.404 |
| 1.69305555555556 | 3.504 | 3.406 |
| 1.69444444444444 | 3.496 | 3.409 |
| 1.69583333333333 | 3.499 | 3.407 |
| 1.69722222222222 | 3.501 | 3.406 |
| 1.69861111111111 | 3.507 | 3.409 |
| 1.7 | 3.503 | 3.41 |
| 1.70138888888889 | 3.514 | 3.41 |
| 1.70277777777778 | 3.517 | 3.427 |
| 1.70416666666667 | 3.52 | 3.427 |
| 1.70555555555556 | 3.517 | 3.431 |
| 1.70694444444444 | 3.501 | 3.428 |
| 1.70833333333333 | 3.52 | 3.428 |
| 1.70972222222222 | 3.491 | 3.429 |
| 1.71111111111111 | 3.497 | 3.428 |
| 1.7125 | 3.488 | 3.413 |
| 1.71388888888889 | 3.486 | 3.41 |
| 1.71527777777778 | 3.484 | 3.41 |
| 1.71666666666667 | 3.484 | 3.414 |
| 1.71805555555556 | 3.489 | 3.41 |
| 1.71944444444444 | 3.486 | 3.409 |
| 1.72083333333333 | 3.488 | 3.408 |
| 1.72222222222222 | 3.489 | 3.411 |
| 1.72361111111111 | 3.492 | 3.428 |
| 1.725 | 3.379 | 3.43 |
| 1.72638888888889 | 3.4 | 3.43 |
| 1.72777777777778 | 3.545 | 3.43 |
| 1.72916666666667 | 3.519 | 3.432 |
| 1.73055555555556 | 3.512 | 3.411 |
| 1.73194444444444 | 3.509 | 3.41 |
| 1.73333333333333 | 3.506 | 3.412 |
| 1.73472222222222 | 3.505 | 3.411 |
| 1.73611111111111 | 3.503 | 3.411 |
| 1.7375 | 3.502 | 3.435 |
| 1.73888888888889 | 3.502 | 3.435 |
| 1.74027777777778 | 3.502 | 3.434 |
| 1.74166666666667 | 3.499 | 3.437 |
| 1.74305555555556 | 3.496 | 3.417 |
| 1.74444444444444 | 3.495 | 3.415 |
| 1.74583333333333 | 3.492 | 3.415 |
| 1.74722222222222 | 3.492 | 3.416 |
| 1.74861111111111 | 3.493 | 3.415 |
| 1.75 | 3.491 | 3.414 |
| 1.75138888888889 | 3.494 | 3.429 |
| 1.75277777777778 | 3.498 | 3.428 |
| 1.75416666666667 | 3.493 | 3.43 |
| 1.75555555555556 | 3.49 | 3.43 |
| 1.75694444444444 | 3.493 | 3.431 |
| 1.75833333333333 | 3.493 | 3.423 |
| 1.75972222222222 | 3.493 | 3.412 |
| 1.76111111111111 | 3.491 | 3.41 |
| 1.7625 | 3.489 | 3.413 |
| 1.76388888888889 | 3.49 | 3.431 |
| 1.76527777777778 | 3.488 | 3.456 |
| 1.76666666666667 | 3.49 | 3.456 |
| 1.76805555555556 | 3.492 | 3.457 |
| 1.76944444444444 | 3.491 | 3.459 |
| 1.77083333333333 | 3.491 | 3.444 |
| 1.77222222222222 | 3.493 | 3.449 |
| 1.77361111111111 | 3.495 | 3.443 |
| 1.775 | 3.494 | 3.443 |
| 1.77638888888889 | 3.491 | 3.421 |
| 1.77777777777778 | 3.493 | 3.422 |
| 1.77916666666667 | 3.494 | 3.414 |
| 1.78055555555556 | 3.491 | 3.411 |
| 1.78194444444444 | 3.491 | 3.422 |
| 1.78333333333333 | 3.49 | 3.428 |
| 1.78472222222222 | 3.491 | 3.427 |
| 1.78611111111111 | 3.492 | 3.431 |
| 1.7875 | 3.492 | 3.432 |
| 1.78888888888889 | 3.491 | 3.431 |
| 1.79027777777778 | 3.487 | 3.408 |
| 1.79166666666667 | 3.49 | 3.411 |
| 1.79305555555556 | 3.488 | 3.409 |
| 1.79444444444444 | 3.489 | 3.41 |
| 1.79583333333333 | 3.488 | 3.407 |
| 1.79722222222222 | 3.493 | 3.409 |
| 1.79861111111111 | 3.49 | 3.41 |
| 1.8 | 3.488 | 3.409 |
| 1.80138888888889 | 3.494 | 3.41 |
| 1.80277777777778 | 3.493 | 3.408 |
| 1.80416666666667 | 3.492 | 3.419 |
| 1.80555555555556 | 3.49 | 3.427 |
| 1.80694444444444 | 3.494 | 3.43 |
| 1.80833333333333 | 3.492 | 3.428 |
| 1.80972222222222 | 3.49 | 3.434 |
| 1.81111111111111 | 3.494 | 3.429 |
| 1.8125 | 3.5 | 3.432 |
| 1.81388888888889 | 3.496 | 3.409 |
| 1.81527777777778 | 3.497 | 3.411 |
| 1.81666666666667 | 3.496 | 3.411 |
| 1.81805555555556 | 3.494 | 3.412 |
| 1.81944444444444 | 3.493 | 3.412 |
| 1.82083333333333 | 3.493 | 3.414 |
| 1.82222222222222 | 3.489 | 3.431 |
| 1.82361111111111 | 3.492 | 3.427 |
| 1.825 | 3.495 | 3.428 |
| 1.82638888888889 | 3.493 | 3.428 |
| 1.82777777777778 | 3.493 | 3.405 |
| 1.82916666666667 | 3.492 | 3.408 |
| 1.83055555555556 | 3.491 | 3.423 |
| 1.83194444444444 | 3.488 | 3.425 |
| 1.83333333333333 | 3.489 | 3.425 |
| 1.83472222222222 | 3.488 | 3.429 |
| 1.83611111111111 | 3.491 | 3.406 |
| 1.8375 | 3.488 | 3.408 |
| 1.83888888888889 | 3.489 | 3.41 |
| 1.84027777777778 | 3.487 | 3.407 |
| 1.84166666666667 | 3.487 | 3.427 |
| 1.84305555555556 | 3.492 | 3.429 |
| 1.84444444444444 | 3.492 | 3.431 |
| 1.84583333333333 | 3.493 | 3.416 |
| 1.84722222222222 | 3.492 | 3.411 |
| 1.84861111111111 | 3.492 | 3.413 |
| 1.85 | 3.492 | 3.408 |
| 1.85138888888889 | 3.493 | 3.411 |
| 1.85277777777778 | 3.492 | 3.415 |
| 1.85416666666667 | 3.493 | 3.414 |
| 1.85555555555556 | 3.492 | 3.41 |
| 1.85694444444444 | 3.492 | 3.433 |
| 1.85833333333333 | 3.492 | 3.428 |
| 1.85972222222222 | 3.492 | 3.43 |
| 1.86111111111111 | 3.493 | 3.428 |
| 1.8625 | 3.494 | 3.426 |
| 1.86388888888889 | 3.497 | 3.428 |
| 1.86527777777778 | 3.493 | 3.409 |
| 1.86666666666667 | 3.497 | 3.409 |
| 1.86805555555556 | 3.495 | 3.409 |
| 1.86944444444444 | 3.494 | 3.403 |
| 1.87083333333333 | 3.494 | 3.408 |
| 1.87222222222222 | 3.496 | 3.404 |
| 1.87361111111111 | 3.495 | 3.409 |
| 1.875 | 3.495 | 3.405 |
| 1.87638888888889 | 3.496 | 3.428 |
| 1.87777777777778 | 3.494 | 3.424 |
| 1.87916666666667 | 3.495 | 3.425 |
| 1.88055555555556 | 3.493 | 3.427 |
| 1.88194444444444 | 3.491 | 3.427 |
| 1.88333333333333 | 3.489 | 3.426 |
| 1.88472222222222 | 3.49 | 3.411 |
| 1.88611111111111 | 3.49 | 3.411 |
| 1.8875 | 3.494 | 3.411 |
| 1.88888888888889 | 3.493 | 3.412 |
| 1.89027777777778 | 3.495 | 3.428 |
| 1.89166666666667 | 3.491 | 3.433 |
| 1.89305555555556 | 3.492 | 3.338 |
| 1.89444444444444 | 3.486 | 3.36 |
| 1.89583333333333 | 3.49 | 3.464 |
| 1.89722222222222 | 3.493 | 3.457 |
| 1.89861111111111 | 3.485 | 3.45 |
| 1.9 | 3.492 | 3.448 |
| 1.90138888888889 | 3.491 | 3.427 |
| 1.90277777777778 | 3.493 | 3.427 |
| 1.90416666666667 | 3.496 | 3.421 |
| 1.90555555555556 | 3.495 | 3.422 |
| 1.90694444444444 | 3.494 | 3.422 |
| 1.90833333333333 | 3.494 | 3.414 |
| 1.90972222222222 | 3.492 | 3.418 |
| 1.91111111111111 | 3.495 | 3.412 |
| 1.9125 | 3.497 | 3.414 |
| 1.91388888888889 | 3.496 | 3.414 |
| 1.91527777777778 | 3.495 | 3.413 |
| 1.91666666666667 | 3.496 | 3.411 |
| 1.91805555555556 | 3.493 | 3.414 |
| 1.91944444444444 | 3.498 | 3.432 |
| 1.92083333333333 | 3.497 | 3.432 |
| 1.92222222222222 | 3.499 | 3.43 |
| 1.92361111111111 | 3.495 | 3.426 |
| 1.925 | 3.499 | 3.426 |
| 1.92638888888889 | 3.496 | 3.427 |
| 1.92777777777778 | 3.501 | 3.426 |
| 1.92916666666667 | 3.497 | 3.409 |
| 1.93055555555556 | 3.5 | 3.408 |
| 1.93194444444444 | 3.499 | 3.41 |
| 1.93333333333333 | 3.496 | 3.414 |
| 1.93472222222222 | 3.49 | 3.408 |
| 1.93611111111111 | 3.498 | 3.41 |
| 1.9375 | 3.489 | 3.413 |
| 1.93888888888889 | 3.492 | 3.413 |
| 1.94027777777778 | 3.491 | 3.412 |
| 1.94166666666667 | 3.493 | 3.411 |
| 1.94305555555556 | 3.494 | 3.413 |
| 1.94444444444444 | 3.496 | 3.411 |
| 1.94583333333333 | 3.494 | 3.416 |
| 1.94722222222222 | 3.49 | 3.43 |
| 1.94861111111111 | 3.493 | 3.434 |
| 1.95 | 3.491 | 3.435 |
| 1.95138888888889 | 3.49 | 3.433 |
| 1.95277777777778 | 3.49 | 3.439 |
| 1.95416666666667 | 3.49 | 3.413 |
| 1.95555555555556 | 3.486 | 3.413 |
| 1.95694444444444 | 3.489 | 3.413 |
| 1.95833333333333 | 3.489 | 3.414 |
| 1.95972222222222 | 3.509 | 3.415 |
| 1.96111111111111 | 3.508 | 3.415 |
| 1.9625 | 3.511 | 3.415 |
| 1.96388888888889 | 3.516 | 3.436 |
| 1.96527777777778 | 3.511 | 3.432 |
| 1.96666666666667 | 3.499 | 3.431 |
| 1.96805555555556 | 3.51 | 3.435 |
| 1.96944444444444 | 3.498 | 3.43 |
| 1.97083333333333 | 3.486 | 3.412 |
| 1.97222222222222 | 3.485 | 3.412 |
| 1.97361111111111 | 3.483 | 3.414 |
| 1.975 | 3.484 | 3.411 |
| 1.97638888888889 | 3.372 | 3.41 |
| 1.97777777777778 | 3.39 | 3.415 |
| 1.97916666666667 | 3.572 | 3.413 |
| 1.98055555555556 | 2.78 | 3.407 |
| 1.98194444444444 | 2.767 | 3.407 |
| 1.98333333333333 | 2.765 | 3.414 |
| 1.98472222222222 | 2.758 | 3.43 |
| 1.98611111111111 | 2.753 | 3.429 |
| 1.9875 | 2.745 | 3.427 |
| 1.98888888888889 | 2.75 | 3.411 |
| 1.99027777777778 | 2.748 | 3.41 |
| 1.99166666666667 | 2.632 | 3.407 |
| 1.99305555555556 | 2.179 | 3.441 |
| 1.99444444444444 | 2.174 | 3.443 |
| 1.99583333333333 | 2.18 | 3.451 |
| 1.99722222222222 | 2.183 | 3.455 |
| 1.99861111111111 | 2.177 | 3.436 |
| 2.0 | 2.177 | 3.436 |
| 2.00138888888889 | 2.181 | 3.435 |
| 2.00277777777778 | 2.176 | 3.419 |
| 2.00416666666667 | 2.181 | 2.939 |
| 2.00555555555556 | 2.181 | 2.757 |
| 2.00694444444444 | 2.103 | 2.748 |
| 2.00833333333333 | 1.81 | 2.754 |
| 2.00972222222222 | 1.809 | 2.771 |
| 2.01111111111111 | 1.808 | 2.77 |
| 2.0125 | 1.811 | 2.769 |
| 2.01388888888889 | 1.807 | 2.768 |
| 2.01527777777778 | 1.808 | 2.767 |
| 2.01666666666667 | 1.808 | 2.769 |
| 2.01805555555556 | 1.452 | 2.749 |
| 2.01944444444444 | 1.448 | 2.327 |
| 2.02083333333333 | 1.449 | 2.187 |
| 2.02222222222222 | 1.449 | 2.188 |
| 2.02361111111111 | 1.448 | 2.189 |
| 2.025 | 1.45 | 2.187 |
| 2.02638888888889 | 1.452 | 2.185 |
| 2.02777777777778 | 1.447 | 2.19 |
| 2.02916666666667 | 1.448 | 2.185 |
| 2.03055555555556 | 1.446 | 2.184 |
| 2.03194444444444 | 1.447 | 2.184 |
| 2.03333333333333 | 1.448 | 2.189 |
| 2.03472222222222 | 1.45 | 2.188 |
| 2.03611111111111 | 1.45 | 2.185 |
| 2.0375 | 1.476 | 1.82 |
| 2.03888888888889 | 1.187 | 1.82 |
| 2.04027777777778 | 1.189 | 1.821 |
| 2.04166666666667 | 1.192 | 1.821 |
| 2.04305555555556 | 1.176 | 1.819 |
| 2.04444444444444 | 1.177 | 1.82 |
| 2.04583333333333 | 1.196 | 1.82 |
| 2.04722222222222 | 1.168 | 1.821 |
| 2.04861111111111 | 1.166 | 1.821 |
| 2.05 | 1.167 | 1.82 |
| 2.05138888888889 | 1.165 | 1.819 |
| 2.05277777777778 | 1.164 | 1.82 |
| 2.05416666666667 | 1.161 | 1.527 |
| 2.05555555555556 | 1.16 | 1.526 |
| 2.05694444444444 | 1.162 | 1.528 |
| 2.05833333333333 | 1.16 | 1.524 |
| 2.05972222222222 | 0.92 | 1.526 |
| 2.06111111111111 | 0.912 | 1.524 |
| 2.0625 | 0.913 | 1.526 |
| 2.06388888888889 | 0.914 | 1.526 |
| 2.06527777777778 | 0.914 | 1.528 |
| 2.06666666666667 | 0.914 | 1.525 |
| 2.06805555555556 | 0.915 | 1.526 |
| 2.06944444444444 | 0.912 | 1.55 |
| 2.07083333333333 | 0.913 | 1.554 |
| 2.07222222222222 | 0.912 | 1.555 |
| 2.07361111111111 | 0.911 | 1.554 |
| 2.075 | 0.914 | 1.555 |
| 2.07638888888889 | 0.912 | 1.556 |
| 2.07777777777778 | 0.912 | 1.318 |
| 2.07916666666667 | 0.912 | 1.309 |
| 2.08055555555556 | 0.913 | 1.292 |
| 2.08194444444444 | 0.914 | 1.293 |
| 2.08333333333333 | 0.913 | 1.288 |
| 2.08472222222222 | 0.693 | 1.285 |
| 2.08611111111111 | 0.691 | 1.283 |
| 2.0875 | 0.691 | 1.285 |
| 2.08888888888889 | 0.69 | 1.284 |
| 2.09027777777778 | 0.697 | 1.284 |
| 2.09166666666667 | 0.694 | 1.284 |
| 2.09305555555556 | 0.692 | 1.108 |
| 2.09444444444444 | 0.693 | 1.108 |
| 2.09583333333333 | 0.695 | 1.107 |
| 2.09722222222222 | 0.693 | 1.106 |
| 2.09861111111111 | 0.696 | 1.107 |
| 2.1 | 0.693 | 1.106 |
| 2.10138888888889 | 0.694 | 1.105 |
| 2.10277777777778 | 0.696 | 1.106 |
| 2.10416666666667 | 0.693 | 1.104 |
| 2.10555555555556 | 0.693 | 1.104 |
| 2.10694444444444 | 0.693 | 1.106 |
| 2.10833333333333 | 0.694 | 1.104 |
| 2.10972222222222 | 0.693 | 1.105 |
| 2.11111111111111 | 0.696 | 1.102 |
| 2.1125 | 0.694 | 1.104 |
| 2.11388888888889 | 0.717 | 0.889 |
| 2.11527777777778 | 0.727 | 0.891 |
| 2.11666666666667 | 0.728 | 0.887 |
| 2.11805555555556 | 0.71 | 0.894 |
| 2.11944444444444 | 0.725 | 0.892 |
| 2.12083333333333 | 0.724 | 0.89 |
| 2.12222222222222 | 0.719 | 0.893 |
| 2.12361111111111 | 0.71 | 0.892 |
| 2.125 | 0.71 | 0.89 |
| 2.12638888888889 | 0.695 | 0.895 |
| 2.12777777777778 | 0.695 | 0.894 |
| 2.12916666666667 | 0.694 | 0.893 |
| 2.13055555555556 | 0.693 | 0.891 |
| 2.13194444444444 | 0.691 | 0.892 |
| 2.13333333333333 | 0.692 | 0.891 |
| 2.13472222222222 | 0.692 | 0.893 |
| 2.13611111111111 | 0.69 | 0.888 |
| 2.1375 | 0.69 | 0.89 |
| 2.13888888888889 | 0.105 | 0.892 |
| 2.14027777777778 | 0.104 | 0.892 |
| 2.14166666666667 | 0.105 | 0.89 |
| 2.14305555555556 | 0.105 | 0.897 |
| 2.14444444444444 | 0.105 | 0.817 |
| 2.14583333333333 | 0.104 | 0.712 |
| 2.14722222222222 | 0.105 | 0.816 |
| 2.14861111111111 | 0.105 | 0.811 |
| 2.15 | 0.105 | 0.804 |
| 2.15138888888889 | 0.105 | 0.802 |
| 2.15277777777778 | 0.105 | 0.796 |
| 2.15416666666667 | 0.105 | 0.793 |
| 2.15555555555556 | 0.105 | 0.795 |
| 2.15694444444444 | 0.105 | 0.772 |
| 2.15833333333333 | 0.105 | 0.772 |
| 2.15972222222222 | 0.105 | 0.767 |
| 2.16111111111111 | 0.03 | 0.764 |
| 2.1625 | 0.029 | 0.764 |
| 2.16388888888889 | 0.029 | 0.76 |
| 2.16527777777778 | 0.029 | 0.759 |
| 2.16666666666667 | 0.029 | 0.762 |
| 2.16805555555556 | 0.029 | 0.76 |
| 2.16944444444444 | 0.029 | 0.76 |
| 2.17083333333333 | 0.029 | 0.76 |
| 2.17222222222222 | 0.029 | 0.759 |
| 2.17361111111111 | 0.029 | 0.759 |
| 2.175 | 0.029 | 0.759 |
| 2.17638888888889 | 0.029 | 0.758 |
| 2.17777777777778 | 0.029 | 0.758 |
| 2.17916666666667 | 0.029 | 0.757 |
| 2.18055555555556 | 0.029 | 0.756 |
| 2.18194444444444 | 0.029 | 0.758 |
| 2.18333333333333 | 0.029 | 0.758 |
| 2.18472222222222 | 0.029 | 0.758 |
| 2.18611111111111 | 0.029 | 0.643 |
| 2.1875 | 0.029 | 0.642 |
| 2.18888888888889 | 0.029 | 0.641 |
| 2.19027777777778 | 0.029 | 0.642 |
| 2.19166666666667 | 0.029 | 0.643 |
| 2.19305555555556 | 0.029 | 0.643 |
| 2.19444444444444 | 0.029 | 0.64 |
| 2.19583333333333 | 0.029 | 0.642 |
| 2.19722222222222 | 0.029 | 0.643 |
| 2.19861111111111 | 0.029 | 0.643 |
| 2.2 | 0.029 | 0.642 |
| 2.20138888888889 | 0.029 | 0.643 |
| 2.20277777777778 | 0.029 | 0.641 |
| 2.20416666666667 | 0.029 | 0.641 |
| 2.20555555555556 | 0.029 | 0.64 |
| 2.20694444444444 | 0.029 | 0.646 |
| 2.20833333333333 | 0.029 | 0.644 |
| 2.20972222222222 | 0.029 | 0.646 |
| 2.21111111111111 | 0.029 | 0.645 |
| 2.2125 | 0.029 | 0.646 |
| 2.21388888888889 | 0.029 | 0.106 |
| 2.21527777777778 | 0.029 | 0.105 |
| 2.21666666666667 | 0.029 | 0.105 |
| 2.21805555555556 | 0.029 | 0.105 |
| 2.21944444444444 | 0.029 | 0.105 |
| 2.22083333333333 | 0.029 | 0.105 |
| 2.22222222222222 | 0.029 | 0.105 |
| 2.22361111111111 | 0.029 | 0.105 |
| 2.225 | 0.029 | 0.106 |
| 2.22638888888889 | 0.029 | 0.105 |
| 2.22777777777778 | 0.029 | 0.105 |
| 2.22916666666667 | 0.029 | 0.105 |
| 2.23055555555556 | 0.029 | 0.106 |
| 2.23194444444444 | 0.029 | 0.105 |
| 2.23333333333333 | 0.029 | 0.105 |
| 2.23472222222222 | 0.029 | 0.105 |
| 2.23611111111111 | 0.029 | 0.029 |
| 2.2375 | 0.029 | 0.029 |
| 2.23888888888889 | 0.029 | 0.029 |
| 2.24027777777778 | 0.029 | 0.029 |
| 2.24166666666667 | 0.029 | 0.029 |
| 2.24305555555556 | 0.029 | 0.031 |
| 2.24444444444444 | 0.029 | 0.028 |
| 2.24583333333333 | 0.029 | 0.029 |
| 2.24722222222222 | 0.029 | 0.029 |
| 2.24861111111111 | 0.029 | 0.029 |
| 2.25 | 0.029 | 0.029 |
| 2.25138888888889 | 0.029 | 0.029 |
| 2.25277777777778 | 0.029 | 0.029 |
| 2.25416666666667 | 0.029 | 0.029 |
| 2.25555555555556 | 0.029 | 0.029 |
| 2.25694444444444 | 0.029 | 0.029 |
| 2.25833333333333 | 0.029 | 0.029 |
| 2.25972222222222 | 0.029 | 0.03 |
| 2.26111111111111 | 0.029 | 0.029 |
| 2.2625 | 0.029 | 0.029 |
| 2.26388888888889 | 0.029 | 0.106 |
| 2.26527777777778 | 0.029 | 0.105 |
| 2.26666666666667 | 0.029 | 0.105 |
| 2.26805555555556 | 0.029 | 0.104 |
| 2.26944444444444 | 0.029 | 0.104 |
| 2.27083333333333 | 0.029 | 0.104 |
| 2.27222222222222 | 0.029 | 0.104 |
| 2.27361111111111 | 0.029 | 0.104 |
| 2.275 | 0.029 | 0.104 |
| 2.27638888888889 | 0.029 | 0.104 |
| 2.27777777777778 | 0.029 | 0.104 |
| 2.27916666666667 | 0.029 | 0.104 |
| 2.28055555555556 | 0.029 | 0.104 |
| 2.28194444444444 | 0.029 | 0.104 |
| 2.28333333333333 | 0.029 | 0.104 |
| 2.28472222222222 | 0.029 | 0.104 |
| 2.28611111111111 | 0.029 | 0.104 |
| 2.2875 | 0.029 | 0.029 |
| 2.28888888888889 | 0.029 | 0.029 |
| 2.29027777777778 | 0.029 | 0.029 |
| 2.29166666666667 | 0.029 | 0.029 |
| 2.29305555555556 | 0.029 | 0.029 |
| 2.29444444444444 | 0.029 | 0.029 |
| 2.29583333333333 | 0.029 | 0.029 |
| 2.29722222222222 | 0.029 | 0.029 |
| 2.29861111111111 | 0.029 | 0.028 |
| 2.3 | 0.029 | 0.029 |
| 2.30138888888889 | 0.029 | 0.029 |
| 2.30277777777778 | 0.029 | 0.029 |
| 2.30416666666667 | 0.029 | 0.029 |
| 2.30555555555556 | 0.029 | 0.029 |
| 2.30694444444444 | 0.029 | 0.029 |
| 2.30833333333333 | 0.029 | 0.029 |
| 2.30972222222222 | 0.029 | 0.03 |
| 2.31111111111111 | 0.029 | 0.029 |
| 2.3125 | 0.029 | 0.029 |
| 2.31388888888889 | 0.029 | 0.029 |
| 2.31527777777778 | 0.029 | 0.028 |
| 2.31666666666667 | 0.029 | 0.029 |
| 2.31805555555556 | 0.029 | 0.029 |
| 2.31944444444444 | 0.029 | 0.029 |
| 2.32083333333333 | 0.029 | 0.029 |
| 2.32222222222222 | 0.029 | 0.029 |
| 2.32361111111111 | 0.029 | 0.029 |
| 2.325 | 0.029 | 0.029 |
| 2.32638888888889 | 0.029 | 0.029 |
| 2.32777777777778 | 0.029 | 0.029 |
| 2.32916666666667 | 0.029 | 0.029 |
| 2.33055555555556 | 0.029 | 0.029 |
| 2.33194444444444 | 0.029 | 0.029 |
| 2.33333333333333 | 0.029 | 0.029 |
| 2.33472222222222 | 0.029 | 0.029 |
| 2.33611111111111 | 0.029 | 0.029 |
| 2.3375 | 0.029 | 0.029 |
| 2.33888888888889 | 0.029 | 0.029 |
| 2.34027777777778 | 0.029 | 0.029 |
| 2.34166666666667 | 0.029 | 0.029 |
| 2.34305555555556 | 0.029 | 0.029 |
| 2.34444444444444 | 0.029 | 0.029 |
| 2.34583333333333 | 0.029 | 0.029 |
| 2.34722222222222 | 0.029 | 0.029 |
| 2.34861111111111 | 0.029 | 0.029 |
| 2.35 | 0.029 | 0.029 |
| 2.35138888888889 | 0.029 | 0.029 |
| 2.35277777777778 | 0.029 | 0.029 |
| 2.35416666666667 | 0.029 | 0.029 |
| 2.35555555555556 | 0.029 | 0.029 |
| 2.35694444444444 | 0.029 | 0.029 |
| 2.35833333333333 | 0.029 | 0.029 |
| 2.35972222222222 | 0.029 | 0.031 |
| 2.36111111111111 | 0.029 | 0.028 |
| 2.3625 | 0.029 | 0.029 |
| 2.36388888888889 | 0.029 | 0.029 |
| 2.36527777777778 | 0.029 | 0.029 |
| 2.36666666666667 | 0.029 | 0.029 |
| 2.36805555555556 | 0.029 | 0.029 |
| 2.36944444444444 | 0.029 | 0.029 |
| 2.37083333333333 | 0.029 | 0.029 |
| 2.37222222222222 | 0.029 | 0.029 |
| 2.37361111111111 | 0.029 | 0.029 |
| 2.375 | 0.029 | 0.029 |
| 2.37638888888889 | 0.029 | 0.029 |
| 2.37777777777778 | 0.029 | 0.029 |
| 2.37916666666667 | 0.029 | 0.029 |
| 2.38055555555556 | 0.029 | 0.029 |
| 2.38194444444444 | 0.029 | 0.029 |
| 2.38333333333333 | 0.029 | 0.029 |
| 2.38472222222222 | 0.029 | 0.029 |
| 2.38611111111111 | 0.029 | 0.029 |
| 2.3875 | 0.029 | 0.029 |
| 2.38888888888889 | 0.029 | 0.029 |
| 2.39027777777778 | 0.029 | 0.029 |
| 2.39166666666667 | 0.029 | 0.029 |
| 2.39305555555556 | 0.029 | 0.029 |
| 2.39444444444444 | 0.029 | 0.029 |
| 2.39583333333333 | 0.029 | 0.029 |
| 2.39722222222222 | 0.029 | 0.029 |
| 2.39861111111111 | 0.029 | 0.029 |
| 2.4 | 0.029 | 0.029 |
| 2.40138888888889 | 0.029 | 0.029 |
| 2.40277777777778 | 0.029 | 0.029 |
| 2.40416666666667 | 0.029 | 0.029 |
| 2.40555555555556 | 0.029 | 0.029 |
| 2.40694444444444 | 0.029 | 0.029 |
| 2.40833333333333 | 0.029 | 0.029 |
| 2.40972222222222 | 0.029 | 0.029 |
| 2.41111111111111 | 0.029 | 0.029 |
| 2.4125 | 0.029 | 0.029 |
| 2.41388888888889 | 0.029 | 0.029 |
| 2.41527777777778 | 0.029 | 0.029 |
| 2.41666666666667 | 0.029 | 0.029 |
| 2.41805555555556 | 0.029 | 0.029 |
| 2.41944444444444 | 0.029 | 0.029 |
| 2.42083333333333 | 0.029 | 0.029 |
| 2.42222222222222 | 0.029 | 0.029 |
| 2.42361111111111 | 0.029 | 0.029 |
| 2.425 | 0.029 | 0.029 |
| 2.42638888888889 | 0.029 | 0.03 |
| 2.42777777777778 | 0.029 | 0.029 |
| 2.42916666666667 | 0.029 | 0.029 |
| 2.43055555555556 | 0.029 | 0.029 |
| 2.43194444444444 | 0.029 | 0.029 |
| 2.43333333333333 | 0.029 | 0.029 |
| 2.43472222222222 | 0.029 | 0.029 |
| 2.43611111111111 | 0.029 | 0.029 |
| 2.4375 | 0.029 | 0.029 |
| 2.43888888888889 | 0.029 | 0.029 |
| 2.44027777777778 | 0.029 | 0.029 |
| 2.44166666666667 | 0.029 | 0.029 |
| 2.44305555555556 | 0.029 | 0.03 |
| 2.44444444444444 | 0.029 | 0.029 |
| 2.44583333333333 | 0.029 | 0.029 |
| 2.44722222222222 | 0.029 | 0.029 |
| 2.44861111111111 | 0.029 | 0.029 |
| 2.45 | 0.029 | 0.029 |
| 2.45138888888889 | 0.029 | 0.029 |
| 2.45277777777778 | 0.029 | 0.029 |
| 2.45416666666667 | 0.029 | 0.029 |
| 2.45555555555556 | 0.029 | 0.029 |
| 2.45694444444444 | 0.029 | 0.029 |
| 2.45833333333333 | 0.029 | 0.029 |
| 2.45972222222222 | 0.029 | 0.029 |
| 2.46111111111111 | 0.029 | 0.029 |
| 2.4625 | 0.029 | 0.029 |
| 2.46388888888889 | 0.029 | 0.029 |
| 2.46527777777778 | 0.029 | 0.029 |
| 2.46666666666667 | 0.029 | 0.029 |
| 2.46805555555556 | 0.029 | 0.029 |
| 2.46944444444444 | 0.029 | 0.029 |
| 2.47083333333333 | 0.029 | 0.029 |
| 2.47222222222222 | 0.029 | 0.029 |
| 2.47361111111111 | 0.029 | 0.029 |
| 2.475 | 0.029 | 0.029 |
| 2.47638888888889 | 0.029 | 0.029 |
| 2.47777777777778 | 0.029 | 0.029 |
| 2.47916666666667 | 0.029 | 0.029 |
| 2.48055555555556 | 0.029 | 0.029 |
| 2.48194444444444 | 0.029 | 0.029 |
| 2.48333333333333 | 0.029 | 0.029 |
| 2.48472222222222 | 0.029 | 0.029 |
| 2.48611111111111 | 0.029 | 0.029 |
| 2.4875 | 0.029 | 0.029 |
| 2.48888888888889 | 0.029 | 0.029 |
| 2.49027777777778 | 0.029 | 0.029 |
| 2.49166666666667 | 0.029 | 0.029 |
| 2.49305555555556 | 0.029 | 0.029 |
| 2.49444444444444 | 0.029 | 0.029 |
| 2.49583333333333 | 0.029 | 0.029 |
| 2.49722222222222 | 0.029 | 0.029 |
| 2.49861111111111 | 0.029 | 0.029 |
| 2.5 | 0.029 | 0.029 |
| 2.50138888888889 | 0.029 | 0.029 |
| 2.50277777777778 | 0.029 | 0.029 |
| 2.50416666666667 | 0.029 | 0.029 |
| 2.50555555555556 | 0.029 | 0.029 |
| 2.50694444444444 | 0.029 | 0.029 |
| 2.50833333333333 | 0.029 | 0.029 |
| 2.50972222222222 | 0.029 | 0.029 |
| 2.51111111111111 | 0.029 | 0.029 |
| 2.5125 | 0.029 | 0.029 |
| 2.51388888888889 | 0.029 | 0.029 |
| 2.51527777777778 | 0.029 | 0.029 |
| 2.51666666666667 | 0.029 | 0.029 |
| 2.51805555555556 | 0.029 | 0.029 |
| 2.51944444444444 | 0.029 | 0.029 |
| 2.52083333333333 | 0.029 | 0.029 |
| 2.52222222222222 | 0.029 | 0.029 |
| 2.52361111111111 | 0.029 | 0.029 |
| 2.525 | 0.029 | 0.029 |
| 2.52638888888889 | 0.029 | 0.03 |
| 2.52777777777778 | 0.029 | 0.029 |
| 2.52916666666667 | 0.029 | 0.029 |
| 2.53055555555556 | 0.029 | 0.029 |
| 2.53194444444444 | 0.029 | 0.029 |
| 2.53333333333333 | 0.029 | 0.029 |
| 2.53472222222222 | 0.029 | 0.029 |
| 2.53611111111111 | 0.029 | 0.029 |
| 2.5375 | 0.029 | 0.029 |
| 2.53888888888889 | 0.029 | 0.029 |
| 2.54027777777778 | 0.029 | 0.029 |
| 2.54166666666667 | 0.029 | 0.029 |
| 2.54305555555556 | 0.029 | 0.029 |
| 2.54444444444444 | 0.029 | 0.029 |
| 2.54583333333333 | 0.029 | 0.029 |
| 2.54722222222222 | 0.029 | 0.029 |
| 2.54861111111111 | 0.029 | 0.029 |
| 2.55 | 0.029 | 0.029 |
| 2.55138888888889 | 0.029 | 0.029 |
| 2.55277777777778 | 0.029 | 0.029 |
| 2.55416666666667 | 0.029 | 0.029 |
| 2.55555555555556 | 0.029 | 0.029 |
| 2.55694444444444 | 0.029 | 0.029 |
| 2.55833333333333 | 0.029 | 0.029 |
| 2.55972222222222 | 0.029 | 0.029 |
| 2.56111111111111 | 0.029 | 0.029 |
| 2.5625 | 0.029 | 0.029 |
| 2.56388888888889 | 0.029 | 0.029 |
| 2.56527777777778 | 0.029 | 0.029 |
| 2.56666666666667 | 0.029 | 0.029 |
| 2.56805555555556 | 0.029 | 0.029 |
| 2.56944444444444 | 0.029 | 0.029 |
| 2.57083333333333 | 0.029 | 0.029 |
| 2.57222222222222 | 0.029 | 0.029 |
| 2.57361111111111 | 0.029 | 0.029 |
| 2.575 | 0.029 | 0.029 |
| 2.57638888888889 | 0.029 | 0.029 |
| 2.57777777777778 | 0.029 | 0.029 |
| 2.57916666666667 | 0.029 | 0.029 |
| 2.58055555555556 | 0.029 | 0.029 |
| 2.58194444444444 | 0.029 | 0.029 |
| 2.58333333333333 | 0.029 | 0.029 |
| 2.58472222222222 | 0.029 | 0.029 |
| 2.58611111111111 | 0.029 | 0.029 |
| 2.5875 | 0.029 | 0.029 |
| 2.58888888888889 | 0.029 | 0.029 |
| 2.59027777777778 | 0.029 | 0.029 |
| 2.59166666666667 | 0.029 | 0.029 |
| 2.59305555555556 | 0.029 | 0.03 |
| 2.59444444444444 | 0.029 | 0.029 |
| 2.59583333333333 | 0.029 | 0.029 |
| 2.59722222222222 | 0.029 | 0.029 |
| 2.59861111111111 | 0.029 | 0.029 |
| 2.6 | 0.029 | 0.029 |
| 2.60138888888889 | 0.029 | 0.029 |
| 2.60277777777778 | 0.029 | 0.029 |
| 2.60416666666667 | 0.029 | 0.029 |
| 2.60555555555556 | 0.029 | 0.029 |
| 2.60694444444444 | 0.029 | 0.029 |
| 2.60833333333333 | 0.029 | 0.029 |
| 2.60972222222222 | 0.029 | 0.029 |
| 2.61111111111111 | 0.029 | 0.029 |
| 2.6125 | 0.029 | 0.029 |
| 2.61388888888889 | 0.029 | 0.029 |
| 2.61527777777778 | 0.029 | 0.029 |
| 2.61666666666667 | 0.029 | 0.029 |
| 2.61805555555556 | 0.029 | 0.029 |
| 2.61944444444444 | 0.029 | 0.029 |
| 2.62083333333333 | 0.029 | 0.029 |
| 2.62222222222222 | 0.029 | 0.029 |
| 2.62361111111111 | 0.028 | 0.029 |
| 2.625 | 0.031 | 0.029 |
| 2.62638888888889 | 0.029 | 0.029 |
| 2.62777777777778 | 0.029 | 0.029 |
| 2.62916666666667 | 0.029 | 0.029 |
| 2.63055555555556 | 0.029 | 0.029 |
| 2.63194444444444 | 0.029 | 0.029 |
| 2.63333333333333 | 0.029 | 0.029 |
| 2.63472222222222 | 0.029 | 0.029 |
| 2.63611111111111 | 0.029 | 0.029 |
| 2.6375 | 0.029 | 0.029 |
| 2.63888888888889 | 0.029 | 0.029 |
| 2.64027777777778 | 0.029 | 0.029 |
| 2.64166666666667 | 0.029 | 0.029 |
| 2.64305555555556 | 0.029 | 0.029 |
| 2.64444444444444 | 0.029 | 0.029 |
| 2.64583333333333 | 0.029 | 0.029 |
| 2.64722222222222 | 0.029 | 0.029 |
| 2.64861111111111 | 0.029 | 0.029 |
| 2.65 | 0.029 | 0.029 |
| 2.65138888888889 | 0.029 | 0.029 |
| 2.65277777777778 | 0.029 | 0.029 |
| 2.65416666666667 | 0.029 | 0.029 |
| 2.65555555555556 | 0.029 | 0.029 |
| 2.65694444444444 | 0.029 | 0.029 |
| 2.65833333333333 | 0.029 | 0.029 |
| 2.65972222222222 | 0.029 | 0.029 |
| 2.66111111111111 | 0.029 | 0.029 |
| 2.6625 | 0.029 | 0.029 |
| 2.66388888888889 | 0.029 | 0.029 |
| 2.66527777777778 | 0.029 | 0.029 |
| 2.66666666666667 | 0.029 | 0.029 |
| 2.66805555555556 | 0.029 | 0.029 |
| 2.66944444444444 | 0.029 | 0.029 |
| 2.67083333333333 | 0.029 | 0.029 |
| 2.67222222222222 | 0.029 | 0.029 |
| 2.67361111111111 | 0.029 | 0.029 |
| 2.675 | 0.029 | 0.029 |
| 2.67638888888889 | 0.029 | 0.029 |
| 2.67777777777778 | 0.029 | 0.029 |
| 2.67916666666667 | 0.029 | 0.029 |
| 2.68055555555556 | 0.029 | 0.029 |
| 2.68194444444444 | 0.029 | 0.029 |
| 2.68333333333333 | 0.029 | 0.029 |
| 2.68472222222222 | 0.029 | 0.029 |
| 2.68611111111111 | 0.029 | 0.029 |
| 2.6875 | 0.029 | 0.029 |
| 2.68888888888889 | 0.029 | 0.029 |
| 2.69027777777778 | 0.029 | 0.029 |
| 2.69166666666667 | 0.029 | 0.029 |
| 2.69305555555556 | 0.029 | 0.029 |
| 2.69444444444444 | 0.029 | 0.029 |
| 2.69583333333333 | 0.029 | 0.029 |
| 2.69722222222222 | 0.029 | 0.029 |
| 2.69861111111111 | 0.029 | 0.029 |
| 2.7 | 0.029 | 0.029 |
| 2.70138888888889 | 0.029 | 0.029 |
| 2.70277777777778 | 0.029 | 0.029 |
| 2.70416666666667 | 0.029 | 0.029 |
| 2.70555555555556 | 0.029 | 0.029 |
| 2.70694444444444 | 0.029 | 0.029 |
| 2.70833333333333 | 0.029 | 0.029 |
| 2.70972222222222 | 0.029 | 0.029 |
| 2.71111111111111 | 0.029 | 0.029 |
| 2.7125 | 0.029 | 0.029 |
| 2.71388888888889 | 0.029 | 0.029 |
| 2.71527777777778 | 0.029 | 0.029 |
| 2.71666666666667 | 0.029 | 0.029 |
| 2.71805555555556 | 0.029 | 0.029 |
| 2.71944444444444 | 0.029 | 0.029 |
| 2.72083333333333 | 0.029 | 0.029 |
| 2.72222222222222 | 0.029 | 0.029 |
| 2.72361111111111 | 0.029 | 0.029 |
| 2.725 | 0.029 | 0.029 |
| 2.72638888888889 | 0.029 | 0.029 |
| 2.72777777777778 | 0.029 | 0.029 |
| 2.72916666666667 | 0.029 | 0.03 |
| 2.73055555555556 | 0.029 | 0.029 |
| 2.73194444444444 | 0.029 | 0.029 |
| 2.73333333333333 | 0.029 | 0.029 |
| 2.73472222222222 | 0.029 | 0.03 |
| 2.73611111111111 | 0.029 | 0.029 |
| 2.7375 | 0.029 | 0.029 |
| 2.73888888888889 | 0.029 | 0.029 |
| 2.74027777777778 | 0.029 | 0.029 |
| 2.74166666666667 | 0.029 | 0.029 |
| 2.74305555555556 | 0.029 | 0.029 |
| 2.74444444444444 | 0.029 | 0.029 |
| 2.74583333333333 | 0.029 | 0.029 |
| 2.74722222222222 | 0.029 | 0.029 |
| 2.74861111111111 | 0.029 | 0.029 |
| 2.75 | 0.029 | 0.029 |
| 2.75138888888889 | 0.029 | 0.029 |
| 2.75277777777778 | 0.029 | 0.029 |
| 2.75416666666667 | 0.029 | 0.029 |
| 2.75555555555556 | 0.029 | 0.029 |
| 2.75694444444444 | 0.029 | 0.029 |
| 2.75833333333333 | 0.029 | 0.029 |
| 2.75972222222222 | 0.029 | 0.029 |
| 2.76111111111111 | 0.029 | 0.029 |
| 2.7625 | 0.029 | 0.029 |
| 2.76388888888889 | 0.029 | 0.029 |
| 2.76527777777778 | 0.029 | 0.029 |
| 2.76666666666667 | 0.029 | 0.029 |
| 2.76805555555556 | 0.029 | 0.029 |
| 2.76944444444444 | 0.029 | 0.029 |
| 2.77083333333333 | 0.029 | 0.029 |
| 2.77222222222222 | 0.029 | 0.029 |
| 2.77361111111111 | 0.029 | 0.029 |
| 2.775 | 0.029 | 0.029 |
| 2.77638888888889 | 0.029 | 0.029 |
| 2.77777777777778 | 0.029 | 0.029 |
| 2.77916666666667 | 0.029 | 0.029 |
| 2.78055555555556 | 0.029 | 0.029 |
| 2.78194444444444 | 0.029 | 0.029 |
| 2.78333333333333 | 0.029 | 0.029 |
| 2.78472222222222 | 0.029 | 0.029 |
| 2.78611111111111 | 0.029 | 0.029 |
| 2.7875 | 0.029 | 0.029 |
| 2.78888888888889 | 0.029 | 0.029 |
| 2.79027777777778 | 0.029 | 0.029 |
| 2.79166666666667 | 0.029 | 0.029 |
| 2.79305555555556 | 0.029 | 0.029 |
| 2.79444444444444 | 0.029 | 0.029 |
| 2.79583333333333 | 0.029 | 0.029 |
| 2.79722222222222 | 0.029 | 0.029 |
| 2.79861111111111 | 0.029 | 0.029 |
| 2.8 | 0.029 | 0.029 |
| 2.80138888888889 | 0.029 | 0.029 |
| 2.80277777777778 | 0.029 | 0.029 |
| 2.80416666666667 | 0.029 | 0.029 |
| 2.80555555555556 | 0.029 | 0.029 |
| 2.80694444444444 | 0.029 | 0.029 |
| 2.80833333333333 | 0.029 | 0.029 |
| 2.80972222222222 | 0.029 | 0.029 |
| 2.81111111111111 | 0.029 | 0.029 |
| 2.8125 | 0.029 | 0.029 |
| 2.81388888888889 | 0.029 | 0.029 |
| 2.81527777777778 | 0.029 | 0.029 |
| 2.81666666666667 | 0.029 | 0.029 |
| 2.81805555555556 | 0.03 | 0.029 |
| 2.81944444444444 | 0.029 | 0.029 |
| 2.82083333333333 | 0.029 | 0.029 |
| 2.82222222222222 | 0.029 | 0.029 |
| 2.82361111111111 | 0.029 | 0.029 |
| 2.825 | 0.029 | 0.029 |
| 2.82638888888889 | 0.029 | 0.029 |
| 2.82777777777778 | 0.029 | 0.029 |
| 2.82916666666667 | 0.029 | 0.029 |
| 2.83055555555556 | 0.029 | 0.029 |
| 2.83194444444444 | 0.029 | 0.029 |
| 2.83333333333333 | 0.029 | 0.029 |
| 2.83472222222222 | 0.029 | 0.029 |
| 2.83611111111111 | 0.029 | 0.029 |
| 2.8375 | 0.029 | 0.029 |
| 2.83888888888889 | 0.029 | 0.029 |
| 2.84027777777778 | 0.029 | 0.029 |
| 2.84166666666667 | 0.029 | 0.029 |
| 2.84305555555556 | 0.029 | 0.029 |
| 2.84444444444444 | 0.029 | 0.029 |
| 2.84583333333333 | 0.029 | 0.029 |
| 2.84722222222222 | 0.029 | 0.029 |
| 2.84861111111111 | 0.029 | 0.029 |
| 2.85 | 0.029 | 0.029 |
| 2.85138888888889 | 0.029 | 0.029 |
| 2.85277777777778 | 0.029 | 0.029 |
| 2.85416666666667 | 0.029 | 0.029 |
| 2.85555555555556 | 0.029 | 0.029 |
| 2.85694444444444 | 0.029 | 0.029 |
| 2.85833333333333 | 0.029 | 0.029 |
| 2.85972222222222 | 0.029 | 0.031 |
| 2.86111111111111 | 0.029 | 0.028 |
| 2.8625 | 0.029 | 0.029 |
| 2.86388888888889 | 0.029 | 0.029 |
| 2.86527777777778 | 0.029 | 0.029 |
| 2.86666666666667 | 0.029 | 0.029 |
| 2.86805555555556 | 0.029 | 0.029 |
| 2.86944444444444 | 0.029 | 0.029 |
| 2.87083333333333 | 0.029 | 0.029 |
| 2.87222222222222 | 0.029 | 0.029 |
| 2.87361111111111 | 0.028 | 0.029 |
| 2.875 | 0.032 | 0.03 |
| 2.87638888888889 | 0.029 | 0.029 |
| 2.87777777777778 | 0.03 | 0.029 |
| 2.87916666666667 | 0.03 | 0.029 |
| 2.88055555555556 | 0.029 | 0.029 |
| 2.88194444444444 | 0.029 | 0.029 |
| 2.88333333333333 | 0.029 | 0.029 |
| 2.88472222222222 | 0.029 | 0.029 |
| 2.88611111111111 | 0.029 | 0.029 |
| 2.8875 | 0.029 | 0.029 |
| 2.88888888888889 | 0.029 | 0.029 |
| 2.89027777777778 | 0.029 | 0.029 |
| 2.89166666666667 | 0.029 | 0.029 |
| 2.89305555555556 | 0.029 | 0.029 |
| 2.89444444444444 | 0.029 | 0.029 |
| 2.89583333333333 | 0.029 | 0.029 |
| 2.89722222222222 | 0.029 | 0.029 |
| 2.89861111111111 | 0.029 | 0.029 |
| 2.9 | 0.029 | 0.029 |
| 2.90138888888889 | 0.029 | 0.029 |
| 2.90277777777778 | 0.029 | 0.029 |
| 2.90416666666667 | 0.029 | 0.029 |
| 2.90555555555556 | 0.029 | 0.029 |
| 2.90694444444444 | 0.029 | 0.029 |
| 2.90833333333333 | 0.029 | 0.029 |
| 2.90972222222222 | 0.029 | 0.03 |
| 2.91111111111111 | 0.029 | 0.029 |
| 2.9125 | 0.029 | 0.029 |
| 2.91388888888889 | 0.029 | 0.029 |
| 2.91527777777778 | 0.029 | 0.029 |
| 2.91666666666667 | 0.029 | 0.029 |
| 2.91805555555556 | 0.029 | 0.029 |
| 2.91944444444444 | 0.029 | 0.029 |
| 2.92083333333333 | 0.029 | 0.029 |
| 2.92222222222222 | 0.029 | 0.029 |
| 2.92361111111111 | 0.029 | 0.029 |
| 2.925 | 0.029 | 0.029 |
| 2.92638888888889 | 0.029 | 0.029 |
| 2.92777777777778 | 0.029 | 0.029 |
| 2.92916666666667 | 0.029 | 0.029 |
| 2.93055555555556 | 0.029 | 0.029 |
| 2.93194444444444 | 0.029 | 0.029 |
| 2.93333333333333 | 0.029 | 0.029 |
| 2.93472222222222 | 0.029 | 0.029 |
| 2.93611111111111 | 0.029 | 0.029 |
| 2.9375 | 0.029 | 0.029 |
| 2.93888888888889 | 0.029 | 0.029 |
| 2.94027777777778 | 0.029 | 0.029 |
| 2.94166666666667 | 0.029 | 0.029 |
| 2.94305555555556 | 0.029 | 0.029 |
| 2.94444444444444 | 0.029 | 0.029 |
| 2.94583333333333 | 0.029 | 0.029 |
| 2.94722222222222 | 0.029 | 0.029 |
| 2.94861111111111 | 0.029 | 0.029 |
| 2.95 | 0.029 | 0.029 |
| 2.95138888888889 | 0.029 | 0.029 |
| 2.95277777777778 | 0.029 | 0.029 |
| 2.95416666666667 | 0.029 | 0.029 |
| 2.95555555555556 | 0.029 | 0.029 |
| 2.95694444444444 | 0.029 | 0.029 |
| 2.95833333333333 | 0.029 | 0.029 |
| 2.95972222222222 | 0.029 | 0.029 |
| 2.96111111111111 | 0.029 | 0.029 |
| 2.9625 | 0.029 | 0.029 |
| 2.96388888888889 | 0.029 | 0.029 |
| 2.96527777777778 | 0.029 | 0.029 |
| 2.96666666666667 | 0.029 | 0.029 |
| 2.96805555555556 | 0.031 | 0.029 |
| 2.96944444444444 | 0.029 | 0.029 |
| 2.97083333333333 | 0.029 | 0.029 |
| 2.97222222222222 | 0.029 | 0.029 |
| 2.97361111111111 | 0.029 | 0.029 |
| 2.975 | 0.029 | 0.029 |
| 2.97638888888889 | 0.029 | 0.029 |
| 2.97777777777778 | 0.029 | 0.029 |
| 2.97916666666667 | 0.029 | 0.029 |
| 2.98055555555556 | 0.029 | 0.029 |
| 2.98194444444444 | 0.029 | 0.029 |
| 2.98333333333333 | 0.029 | 0.029 |
| 2.98472222222222 | 0.029 | 0.029 |
| 2.98611111111111 | 0.029 | 0.029 |
| 2.9875 | 0.029 | 0.029 |
| 2.98888888888889 | 0.029 | 0.029 |
| 2.99027777777778 | 0.029 | 0.029 |
| 2.99166666666667 | 0.029 | 0.029 |
| 2.99305555555556 | 0.029 | 0.029 |
| 2.99444444444444 | 0.029 | 0.029 |
| 2.99583333333333 | 0.029 | 0.029 |
| 2.99722222222222 | 0.029 | 0.029 |
| 2.99861111111111 | 0.029 | 0.029 |
| 3.0 | 0.029 | 0.029 |